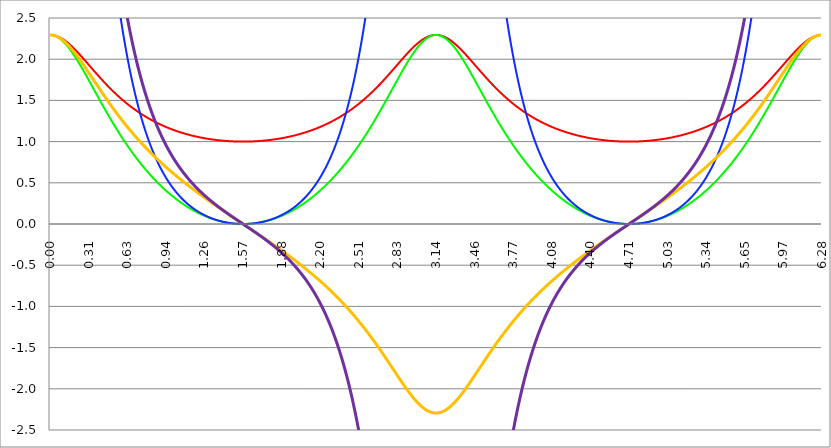
| Category | Series 1 | Series 0 | Series 2 | Series 3 | Series 4 |
|---|---|---|---|---|---|
| 0.0 | 2.294 | 2.294 | 12.075 | 2.294 | 12.075 |
| 0.00314159265358979 | 2.294 | 2.294 | 12.074 | 2.294 | 12.074 |
| 0.00628318530717958 | 2.294 | 2.294 | 12.071 | 2.294 | 12.071 |
| 0.00942477796076938 | 2.294 | 2.294 | 12.067 | 2.294 | 12.067 |
| 0.0125663706143592 | 2.293 | 2.293 | 12.06 | 2.293 | 12.061 |
| 0.015707963267949 | 2.293 | 2.292 | 12.053 | 2.293 | 12.054 |
| 0.0188495559215388 | 2.292 | 2.292 | 12.043 | 2.292 | 12.045 |
| 0.0219911485751285 | 2.292 | 2.291 | 12.031 | 2.291 | 12.034 |
| 0.0251327412287183 | 2.291 | 2.29 | 12.018 | 2.29 | 12.022 |
| 0.0282743338823081 | 2.29 | 2.288 | 12.003 | 2.289 | 12.008 |
| 0.0314159265358979 | 2.289 | 2.287 | 11.987 | 2.288 | 11.993 |
| 0.0345575191894877 | 2.288 | 2.286 | 11.969 | 2.287 | 11.976 |
| 0.0376991118430775 | 2.287 | 2.284 | 11.949 | 2.286 | 11.957 |
| 0.0408407044966673 | 2.286 | 2.282 | 11.927 | 2.284 | 11.937 |
| 0.0439822971502571 | 2.285 | 2.28 | 11.904 | 2.283 | 11.915 |
| 0.0471238898038469 | 2.283 | 2.278 | 11.879 | 2.281 | 11.892 |
| 0.0502654824574367 | 2.282 | 2.276 | 11.852 | 2.279 | 11.867 |
| 0.0534070751110265 | 2.28 | 2.274 | 11.824 | 2.277 | 11.841 |
| 0.0565486677646163 | 2.279 | 2.271 | 11.794 | 2.275 | 11.813 |
| 0.059690260418206 | 2.277 | 2.269 | 11.763 | 2.273 | 11.784 |
| 0.0628318530717958 | 2.275 | 2.266 | 11.73 | 2.271 | 11.753 |
| 0.0659734457253856 | 2.273 | 2.263 | 11.695 | 2.268 | 11.721 |
| 0.0691150383789754 | 2.271 | 2.26 | 11.66 | 2.266 | 11.687 |
| 0.0722566310325652 | 2.269 | 2.257 | 11.622 | 2.263 | 11.652 |
| 0.075398223686155 | 2.267 | 2.254 | 11.583 | 2.26 | 11.616 |
| 0.0785398163397448 | 2.265 | 2.251 | 11.543 | 2.258 | 11.579 |
| 0.0816814089933346 | 2.262 | 2.247 | 11.501 | 2.255 | 11.54 |
| 0.0848230016469244 | 2.26 | 2.244 | 11.458 | 2.252 | 11.499 |
| 0.0879645943005142 | 2.257 | 2.24 | 11.413 | 2.249 | 11.458 |
| 0.091106186954104 | 2.255 | 2.236 | 11.368 | 2.245 | 11.415 |
| 0.0942477796076937 | 2.252 | 2.232 | 11.32 | 2.242 | 11.371 |
| 0.0973893722612835 | 2.249 | 2.228 | 11.272 | 2.239 | 11.326 |
| 0.100530964914873 | 2.246 | 2.224 | 11.222 | 2.235 | 11.279 |
| 0.103672557568463 | 2.244 | 2.219 | 11.171 | 2.231 | 11.232 |
| 0.106814150222053 | 2.241 | 2.215 | 11.119 | 2.228 | 11.183 |
| 0.109955742875643 | 2.237 | 2.211 | 11.066 | 2.224 | 11.133 |
| 0.113097335529233 | 2.234 | 2.206 | 11.012 | 2.22 | 11.083 |
| 0.116238928182822 | 2.231 | 2.201 | 10.956 | 2.216 | 11.031 |
| 0.119380520836412 | 2.228 | 2.196 | 10.9 | 2.212 | 10.978 |
| 0.122522113490002 | 2.224 | 2.191 | 10.842 | 2.208 | 10.924 |
| 0.125663706143592 | 2.221 | 2.186 | 10.784 | 2.203 | 10.869 |
| 0.128805298797181 | 2.217 | 2.181 | 10.724 | 2.199 | 10.814 |
| 0.131946891450771 | 2.214 | 2.176 | 10.664 | 2.195 | 10.757 |
| 0.135088484104361 | 2.21 | 2.17 | 10.602 | 2.19 | 10.7 |
| 0.138230076757951 | 2.207 | 2.165 | 10.54 | 2.186 | 10.642 |
| 0.141371669411541 | 2.203 | 2.159 | 10.477 | 2.181 | 10.583 |
| 0.14451326206513 | 2.199 | 2.153 | 10.413 | 2.176 | 10.523 |
| 0.14765485471872 | 2.195 | 2.148 | 10.348 | 2.171 | 10.462 |
| 0.15079644737231 | 2.191 | 2.142 | 10.283 | 2.166 | 10.401 |
| 0.1539380400259 | 2.187 | 2.136 | 10.217 | 2.161 | 10.339 |
| 0.15707963267949 | 2.183 | 2.13 | 10.15 | 2.156 | 10.276 |
| 0.160221225333079 | 2.179 | 2.124 | 10.082 | 2.151 | 10.213 |
| 0.163362817986669 | 2.175 | 2.117 | 10.014 | 2.146 | 10.149 |
| 0.166504410640259 | 2.171 | 2.111 | 9.946 | 2.141 | 10.085 |
| 0.169646003293849 | 2.166 | 2.105 | 9.876 | 2.135 | 10.02 |
| 0.172787595947439 | 2.162 | 2.098 | 9.807 | 2.13 | 9.955 |
| 0.175929188601028 | 2.158 | 2.092 | 9.736 | 2.124 | 9.889 |
| 0.179070781254618 | 2.153 | 2.085 | 9.666 | 2.119 | 9.823 |
| 0.182212373908208 | 2.149 | 2.078 | 9.594 | 2.113 | 9.756 |
| 0.185353966561798 | 2.144 | 2.071 | 9.523 | 2.107 | 9.689 |
| 0.188495559215388 | 2.14 | 2.064 | 9.451 | 2.102 | 9.621 |
| 0.191637151868977 | 2.135 | 2.058 | 9.379 | 2.096 | 9.554 |
| 0.194778744522567 | 2.13 | 2.051 | 9.306 | 2.09 | 9.485 |
| 0.197920337176157 | 2.126 | 2.043 | 9.233 | 2.084 | 9.417 |
| 0.201061929829747 | 2.121 | 2.036 | 9.16 | 2.078 | 9.348 |
| 0.204203522483336 | 2.116 | 2.029 | 9.087 | 2.072 | 9.279 |
| 0.207345115136926 | 2.111 | 2.022 | 9.013 | 2.066 | 9.21 |
| 0.210486707790516 | 2.107 | 2.015 | 8.939 | 2.06 | 9.141 |
| 0.213628300444106 | 2.102 | 2.007 | 8.865 | 2.054 | 9.071 |
| 0.216769893097696 | 2.097 | 2 | 8.791 | 2.048 | 9.002 |
| 0.219911485751285 | 2.092 | 1.992 | 8.717 | 2.041 | 8.932 |
| 0.223053078404875 | 2.087 | 1.985 | 8.643 | 2.035 | 8.862 |
| 0.226194671058465 | 2.082 | 1.977 | 8.568 | 2.029 | 8.792 |
| 0.229336263712055 | 2.077 | 1.969 | 8.494 | 2.022 | 8.722 |
| 0.232477856365645 | 2.072 | 1.962 | 8.42 | 2.016 | 8.652 |
| 0.235619449019234 | 2.067 | 1.954 | 8.345 | 2.01 | 8.582 |
| 0.238761041672824 | 2.062 | 1.946 | 8.271 | 2.003 | 8.512 |
| 0.241902634326414 | 2.056 | 1.938 | 8.197 | 1.996 | 8.443 |
| 0.245044226980004 | 2.051 | 1.93 | 8.122 | 1.99 | 8.373 |
| 0.248185819633594 | 2.046 | 1.923 | 8.048 | 1.983 | 8.303 |
| 0.251327412287183 | 2.041 | 1.915 | 7.974 | 1.977 | 8.233 |
| 0.254469004940773 | 2.036 | 1.907 | 7.901 | 1.97 | 8.163 |
| 0.257610597594363 | 2.03 | 1.899 | 7.827 | 1.963 | 8.094 |
| 0.260752190247953 | 2.025 | 1.891 | 7.753 | 1.957 | 8.024 |
| 0.263893782901543 | 2.02 | 1.882 | 7.68 | 1.95 | 7.955 |
| 0.267035375555132 | 2.015 | 1.874 | 7.607 | 1.943 | 7.886 |
| 0.270176968208722 | 2.009 | 1.866 | 7.534 | 1.936 | 7.817 |
| 0.273318560862312 | 2.004 | 1.858 | 7.461 | 1.93 | 7.749 |
| 0.276460153515902 | 1.999 | 1.85 | 7.389 | 1.923 | 7.68 |
| 0.279601746169492 | 1.993 | 1.841 | 7.316 | 1.916 | 7.612 |
| 0.282743338823082 | 1.988 | 1.833 | 7.244 | 1.909 | 7.544 |
| 0.285884931476671 | 1.983 | 1.825 | 7.173 | 1.902 | 7.476 |
| 0.289026524130261 | 1.977 | 1.817 | 7.102 | 1.895 | 7.409 |
| 0.292168116783851 | 1.972 | 1.808 | 7.03 | 1.888 | 7.342 |
| 0.295309709437441 | 1.966 | 1.8 | 6.96 | 1.881 | 7.275 |
| 0.298451302091031 | 1.961 | 1.791 | 6.889 | 1.874 | 7.208 |
| 0.30159289474462 | 1.956 | 1.783 | 6.819 | 1.867 | 7.142 |
| 0.30473448739821 | 1.95 | 1.775 | 6.75 | 1.86 | 7.076 |
| 0.3078760800518 | 1.945 | 1.766 | 6.681 | 1.853 | 7.01 |
| 0.31101767270539 | 1.939 | 1.758 | 6.612 | 1.846 | 6.945 |
| 0.31415926535898 | 1.934 | 1.749 | 6.543 | 1.839 | 6.88 |
| 0.31730085801257 | 1.929 | 1.741 | 6.475 | 1.832 | 6.815 |
| 0.320442450666159 | 1.923 | 1.732 | 6.408 | 1.825 | 6.751 |
| 0.323584043319749 | 1.918 | 1.724 | 6.34 | 1.818 | 6.687 |
| 0.326725635973339 | 1.912 | 1.715 | 6.274 | 1.811 | 6.624 |
| 0.329867228626929 | 1.907 | 1.707 | 6.207 | 1.804 | 6.561 |
| 0.333008821280519 | 1.902 | 1.698 | 6.141 | 1.797 | 6.498 |
| 0.336150413934108 | 1.896 | 1.69 | 6.076 | 1.79 | 6.436 |
| 0.339292006587698 | 1.891 | 1.681 | 6.011 | 1.783 | 6.374 |
| 0.342433599241288 | 1.885 | 1.673 | 5.946 | 1.776 | 6.313 |
| 0.345575191894878 | 1.88 | 1.664 | 5.882 | 1.769 | 6.252 |
| 0.348716784548468 | 1.875 | 1.656 | 5.818 | 1.762 | 6.191 |
| 0.351858377202058 | 1.869 | 1.647 | 5.755 | 1.755 | 6.131 |
| 0.354999969855647 | 1.864 | 1.639 | 5.692 | 1.748 | 6.071 |
| 0.358141562509237 | 1.858 | 1.63 | 5.63 | 1.741 | 6.012 |
| 0.361283155162827 | 1.853 | 1.622 | 5.568 | 1.733 | 5.953 |
| 0.364424747816417 | 1.848 | 1.613 | 5.507 | 1.726 | 5.894 |
| 0.367566340470007 | 1.842 | 1.605 | 5.446 | 1.719 | 5.836 |
| 0.370707933123597 | 1.837 | 1.596 | 5.386 | 1.712 | 5.779 |
| 0.373849525777186 | 1.832 | 1.587 | 5.326 | 1.705 | 5.722 |
| 0.376991118430776 | 1.826 | 1.579 | 5.267 | 1.698 | 5.665 |
| 0.380132711084366 | 1.821 | 1.57 | 5.208 | 1.691 | 5.609 |
| 0.383274303737956 | 1.816 | 1.562 | 5.15 | 1.684 | 5.553 |
| 0.386415896391546 | 1.811 | 1.553 | 5.092 | 1.677 | 5.498 |
| 0.389557489045135 | 1.805 | 1.545 | 5.035 | 1.67 | 5.443 |
| 0.392699081698725 | 1.8 | 1.536 | 4.978 | 1.663 | 5.389 |
| 0.395840674352315 | 1.795 | 1.528 | 4.922 | 1.656 | 5.335 |
| 0.398982267005905 | 1.79 | 1.52 | 4.866 | 1.649 | 5.281 |
| 0.402123859659495 | 1.784 | 1.511 | 4.811 | 1.642 | 5.228 |
| 0.405265452313085 | 1.779 | 1.503 | 4.756 | 1.635 | 5.176 |
| 0.408407044966674 | 1.774 | 1.494 | 4.702 | 1.628 | 5.124 |
| 0.411548637620264 | 1.769 | 1.486 | 4.649 | 1.621 | 5.072 |
| 0.414690230273854 | 1.764 | 1.477 | 4.595 | 1.614 | 5.021 |
| 0.417831822927444 | 1.759 | 1.469 | 4.543 | 1.607 | 4.97 |
| 0.420973415581034 | 1.753 | 1.461 | 4.49 | 1.6 | 4.92 |
| 0.424115008234623 | 1.748 | 1.452 | 4.439 | 1.593 | 4.87 |
| 0.427256600888213 | 1.743 | 1.444 | 4.388 | 1.586 | 4.821 |
| 0.430398193541803 | 1.738 | 1.436 | 4.337 | 1.58 | 4.772 |
| 0.433539786195393 | 1.733 | 1.427 | 4.287 | 1.573 | 4.724 |
| 0.436681378848983 | 1.728 | 1.419 | 4.237 | 1.566 | 4.676 |
| 0.439822971502573 | 1.723 | 1.411 | 4.188 | 1.559 | 4.628 |
| 0.442964564156162 | 1.718 | 1.402 | 4.139 | 1.552 | 4.581 |
| 0.446106156809752 | 1.713 | 1.394 | 4.091 | 1.545 | 4.535 |
| 0.449247749463342 | 1.708 | 1.386 | 4.043 | 1.539 | 4.489 |
| 0.452389342116932 | 1.703 | 1.378 | 3.996 | 1.532 | 4.443 |
| 0.455530934770522 | 1.698 | 1.369 | 3.949 | 1.525 | 4.398 |
| 0.458672527424111 | 1.693 | 1.361 | 3.903 | 1.518 | 4.353 |
| 0.461814120077701 | 1.688 | 1.353 | 3.857 | 1.511 | 4.309 |
| 0.464955712731291 | 1.683 | 1.345 | 3.812 | 1.505 | 4.265 |
| 0.468097305384881 | 1.679 | 1.337 | 3.767 | 1.498 | 4.221 |
| 0.471238898038471 | 1.674 | 1.329 | 3.723 | 1.491 | 4.178 |
| 0.474380490692061 | 1.669 | 1.321 | 3.679 | 1.485 | 4.135 |
| 0.47752208334565 | 1.664 | 1.313 | 3.635 | 1.478 | 4.093 |
| 0.48066367599924 | 1.659 | 1.305 | 3.592 | 1.471 | 4.051 |
| 0.48380526865283 | 1.655 | 1.297 | 3.55 | 1.465 | 4.01 |
| 0.48694686130642 | 1.65 | 1.289 | 3.508 | 1.458 | 3.969 |
| 0.49008845396001 | 1.645 | 1.281 | 3.466 | 1.452 | 3.929 |
| 0.493230046613599 | 1.64 | 1.273 | 3.425 | 1.445 | 3.889 |
| 0.496371639267189 | 1.636 | 1.265 | 3.384 | 1.438 | 3.849 |
| 0.499513231920779 | 1.631 | 1.257 | 3.344 | 1.432 | 3.81 |
| 0.502654824574369 | 1.627 | 1.249 | 3.304 | 1.425 | 3.771 |
| 0.505796417227959 | 1.622 | 1.241 | 3.265 | 1.419 | 3.732 |
| 0.508938009881549 | 1.617 | 1.233 | 3.226 | 1.412 | 3.694 |
| 0.512079602535138 | 1.613 | 1.226 | 3.188 | 1.406 | 3.657 |
| 0.515221195188728 | 1.608 | 1.218 | 3.149 | 1.399 | 3.619 |
| 0.518362787842318 | 1.604 | 1.21 | 3.112 | 1.393 | 3.582 |
| 0.521504380495908 | 1.599 | 1.202 | 3.075 | 1.387 | 3.546 |
| 0.524645973149498 | 1.595 | 1.195 | 3.038 | 1.38 | 3.51 |
| 0.527787565803087 | 1.59 | 1.187 | 3.001 | 1.374 | 3.474 |
| 0.530929158456677 | 1.586 | 1.179 | 2.965 | 1.367 | 3.439 |
| 0.534070751110267 | 1.581 | 1.172 | 2.93 | 1.361 | 3.404 |
| 0.537212343763857 | 1.577 | 1.164 | 2.895 | 1.355 | 3.369 |
| 0.540353936417447 | 1.573 | 1.156 | 2.86 | 1.349 | 3.335 |
| 0.543495529071037 | 1.568 | 1.149 | 2.825 | 1.342 | 3.301 |
| 0.546637121724626 | 1.564 | 1.141 | 2.791 | 1.336 | 3.268 |
| 0.549778714378216 | 1.56 | 1.134 | 2.758 | 1.33 | 3.234 |
| 0.552920307031806 | 1.555 | 1.126 | 2.725 | 1.324 | 3.202 |
| 0.556061899685396 | 1.551 | 1.119 | 2.692 | 1.317 | 3.169 |
| 0.559203492338986 | 1.547 | 1.111 | 2.659 | 1.311 | 3.137 |
| 0.562345084992576 | 1.543 | 1.104 | 2.627 | 1.305 | 3.105 |
| 0.565486677646165 | 1.538 | 1.097 | 2.595 | 1.299 | 3.074 |
| 0.568628270299755 | 1.534 | 1.089 | 2.564 | 1.293 | 3.043 |
| 0.571769862953345 | 1.53 | 1.082 | 2.533 | 1.287 | 3.012 |
| 0.574911455606935 | 1.526 | 1.075 | 2.502 | 1.281 | 2.982 |
| 0.578053048260525 | 1.522 | 1.067 | 2.472 | 1.275 | 2.951 |
| 0.581194640914114 | 1.518 | 1.06 | 2.442 | 1.268 | 2.922 |
| 0.584336233567704 | 1.514 | 1.053 | 2.412 | 1.262 | 2.892 |
| 0.587477826221294 | 1.51 | 1.046 | 2.383 | 1.256 | 2.863 |
| 0.590619418874884 | 1.506 | 1.039 | 2.354 | 1.25 | 2.834 |
| 0.593761011528474 | 1.502 | 1.032 | 2.326 | 1.245 | 2.806 |
| 0.596902604182064 | 1.498 | 1.024 | 2.297 | 1.239 | 2.778 |
| 0.600044196835653 | 1.494 | 1.017 | 2.269 | 1.233 | 2.75 |
| 0.603185789489243 | 1.49 | 1.01 | 2.242 | 1.227 | 2.722 |
| 0.606327382142833 | 1.486 | 1.003 | 2.215 | 1.221 | 2.695 |
| 0.609468974796423 | 1.482 | 0.996 | 2.188 | 1.215 | 2.668 |
| 0.612610567450013 | 1.478 | 0.989 | 2.161 | 1.209 | 2.641 |
| 0.615752160103602 | 1.474 | 0.982 | 2.135 | 1.203 | 2.615 |
| 0.618893752757192 | 1.47 | 0.975 | 2.109 | 1.198 | 2.589 |
| 0.622035345410782 | 1.466 | 0.969 | 2.083 | 1.192 | 2.563 |
| 0.625176938064372 | 1.463 | 0.962 | 2.057 | 1.186 | 2.537 |
| 0.628318530717962 | 1.459 | 0.955 | 2.032 | 1.18 | 2.512 |
| 0.631460123371551 | 1.455 | 0.948 | 2.007 | 1.175 | 2.487 |
| 0.634601716025141 | 1.451 | 0.941 | 1.983 | 1.169 | 2.462 |
| 0.637743308678731 | 1.448 | 0.935 | 1.959 | 1.163 | 2.438 |
| 0.640884901332321 | 1.444 | 0.928 | 1.935 | 1.157 | 2.414 |
| 0.644026493985911 | 1.44 | 0.921 | 1.911 | 1.152 | 2.39 |
| 0.647168086639501 | 1.437 | 0.914 | 1.888 | 1.146 | 2.366 |
| 0.65030967929309 | 1.433 | 0.908 | 1.864 | 1.141 | 2.343 |
| 0.65345127194668 | 1.43 | 0.901 | 1.842 | 1.135 | 2.319 |
| 0.65659286460027 | 1.426 | 0.895 | 1.819 | 1.129 | 2.296 |
| 0.65973445725386 | 1.422 | 0.888 | 1.797 | 1.124 | 2.274 |
| 0.66287604990745 | 1.419 | 0.882 | 1.775 | 1.118 | 2.251 |
| 0.666017642561039 | 1.415 | 0.875 | 1.753 | 1.113 | 2.229 |
| 0.669159235214629 | 1.412 | 0.869 | 1.731 | 1.107 | 2.207 |
| 0.672300827868219 | 1.408 | 0.862 | 1.71 | 1.102 | 2.186 |
| 0.675442420521809 | 1.405 | 0.856 | 1.689 | 1.096 | 2.164 |
| 0.678584013175399 | 1.401 | 0.849 | 1.668 | 1.091 | 2.143 |
| 0.681725605828989 | 1.398 | 0.843 | 1.648 | 1.086 | 2.122 |
| 0.684867198482578 | 1.395 | 0.837 | 1.627 | 1.08 | 2.101 |
| 0.688008791136168 | 1.391 | 0.83 | 1.607 | 1.075 | 2.08 |
| 0.691150383789758 | 1.388 | 0.824 | 1.587 | 1.069 | 2.06 |
| 0.694291976443348 | 1.385 | 0.818 | 1.568 | 1.064 | 2.04 |
| 0.697433569096938 | 1.381 | 0.812 | 1.548 | 1.059 | 2.02 |
| 0.700575161750528 | 1.378 | 0.805 | 1.529 | 1.053 | 2 |
| 0.703716754404117 | 1.375 | 0.799 | 1.51 | 1.048 | 1.981 |
| 0.706858347057707 | 1.371 | 0.793 | 1.492 | 1.043 | 1.962 |
| 0.709999939711297 | 1.368 | 0.787 | 1.473 | 1.038 | 1.943 |
| 0.713141532364887 | 1.365 | 0.781 | 1.455 | 1.032 | 1.924 |
| 0.716283125018477 | 1.362 | 0.775 | 1.437 | 1.027 | 1.905 |
| 0.719424717672066 | 1.359 | 0.769 | 1.419 | 1.022 | 1.887 |
| 0.722566310325656 | 1.356 | 0.763 | 1.401 | 1.017 | 1.868 |
| 0.725707902979246 | 1.352 | 0.757 | 1.384 | 1.012 | 1.85 |
| 0.728849495632836 | 1.349 | 0.751 | 1.367 | 1.006 | 1.832 |
| 0.731991088286426 | 1.346 | 0.745 | 1.35 | 1.001 | 1.815 |
| 0.735132680940016 | 1.343 | 0.739 | 1.333 | 0.996 | 1.797 |
| 0.738274273593605 | 1.34 | 0.733 | 1.316 | 0.991 | 1.78 |
| 0.741415866247195 | 1.337 | 0.727 | 1.3 | 0.986 | 1.763 |
| 0.744557458900785 | 1.334 | 0.721 | 1.284 | 0.981 | 1.746 |
| 0.747699051554375 | 1.331 | 0.716 | 1.268 | 0.976 | 1.729 |
| 0.750840644207965 | 1.328 | 0.71 | 1.252 | 0.971 | 1.712 |
| 0.753982236861554 | 1.325 | 0.704 | 1.236 | 0.966 | 1.696 |
| 0.757123829515144 | 1.322 | 0.698 | 1.221 | 0.961 | 1.68 |
| 0.760265422168734 | 1.319 | 0.693 | 1.205 | 0.956 | 1.664 |
| 0.763407014822324 | 1.316 | 0.687 | 1.19 | 0.951 | 1.648 |
| 0.766548607475914 | 1.313 | 0.681 | 1.175 | 0.946 | 1.632 |
| 0.769690200129504 | 1.31 | 0.676 | 1.161 | 0.941 | 1.616 |
| 0.772831792783093 | 1.308 | 0.67 | 1.146 | 0.936 | 1.601 |
| 0.775973385436683 | 1.305 | 0.665 | 1.132 | 0.931 | 1.586 |
| 0.779114978090273 | 1.302 | 0.659 | 1.117 | 0.926 | 1.57 |
| 0.782256570743863 | 1.299 | 0.654 | 1.103 | 0.922 | 1.555 |
| 0.785398163397453 | 1.296 | 0.648 | 1.089 | 0.917 | 1.541 |
| 0.788539756051042 | 1.294 | 0.643 | 1.076 | 0.912 | 1.526 |
| 0.791681348704632 | 1.291 | 0.637 | 1.062 | 0.907 | 1.512 |
| 0.794822941358222 | 1.288 | 0.632 | 1.049 | 0.902 | 1.497 |
| 0.797964534011812 | 1.285 | 0.627 | 1.035 | 0.897 | 1.483 |
| 0.801106126665402 | 1.283 | 0.621 | 1.022 | 0.893 | 1.469 |
| 0.804247719318992 | 1.28 | 0.616 | 1.009 | 0.888 | 1.455 |
| 0.807389311972581 | 1.277 | 0.611 | 0.996 | 0.883 | 1.441 |
| 0.810530904626171 | 1.275 | 0.605 | 0.984 | 0.878 | 1.428 |
| 0.813672497279761 | 1.272 | 0.6 | 0.971 | 0.874 | 1.414 |
| 0.816814089933351 | 1.27 | 0.595 | 0.959 | 0.869 | 1.401 |
| 0.819955682586941 | 1.267 | 0.59 | 0.947 | 0.864 | 1.388 |
| 0.823097275240531 | 1.264 | 0.585 | 0.935 | 0.86 | 1.374 |
| 0.82623886789412 | 1.262 | 0.579 | 0.923 | 0.855 | 1.362 |
| 0.82938046054771 | 1.259 | 0.574 | 0.911 | 0.85 | 1.349 |
| 0.8325220532013 | 1.257 | 0.569 | 0.899 | 0.846 | 1.336 |
| 0.83566364585489 | 1.254 | 0.564 | 0.888 | 0.841 | 1.323 |
| 0.83880523850848 | 1.252 | 0.559 | 0.876 | 0.837 | 1.311 |
| 0.841946831162069 | 1.249 | 0.554 | 0.865 | 0.832 | 1.299 |
| 0.845088423815659 | 1.247 | 0.549 | 0.854 | 0.827 | 1.286 |
| 0.848230016469249 | 1.244 | 0.544 | 0.843 | 0.823 | 1.274 |
| 0.851371609122839 | 1.242 | 0.539 | 0.832 | 0.818 | 1.262 |
| 0.854513201776429 | 1.24 | 0.534 | 0.821 | 0.814 | 1.251 |
| 0.857654794430019 | 1.237 | 0.53 | 0.81 | 0.809 | 1.239 |
| 0.860796387083608 | 1.235 | 0.525 | 0.8 | 0.805 | 1.227 |
| 0.863937979737198 | 1.232 | 0.52 | 0.79 | 0.8 | 1.216 |
| 0.867079572390788 | 1.23 | 0.515 | 0.779 | 0.796 | 1.204 |
| 0.870221165044378 | 1.228 | 0.51 | 0.769 | 0.791 | 1.193 |
| 0.873362757697968 | 1.225 | 0.505 | 0.759 | 0.787 | 1.182 |
| 0.876504350351557 | 1.223 | 0.501 | 0.749 | 0.783 | 1.171 |
| 0.879645943005147 | 1.221 | 0.496 | 0.739 | 0.778 | 1.16 |
| 0.882787535658737 | 1.219 | 0.491 | 0.73 | 0.774 | 1.149 |
| 0.885929128312327 | 1.216 | 0.487 | 0.72 | 0.769 | 1.138 |
| 0.889070720965917 | 1.214 | 0.482 | 0.711 | 0.765 | 1.128 |
| 0.892212313619507 | 1.212 | 0.477 | 0.701 | 0.761 | 1.117 |
| 0.895353906273096 | 1.21 | 0.473 | 0.692 | 0.756 | 1.107 |
| 0.898495498926686 | 1.208 | 0.468 | 0.683 | 0.752 | 1.097 |
| 0.901637091580276 | 1.205 | 0.464 | 0.674 | 0.748 | 1.086 |
| 0.904778684233866 | 1.203 | 0.459 | 0.665 | 0.743 | 1.076 |
| 0.907920276887456 | 1.201 | 0.455 | 0.656 | 0.739 | 1.066 |
| 0.911061869541045 | 1.199 | 0.45 | 0.647 | 0.735 | 1.056 |
| 0.914203462194635 | 1.197 | 0.446 | 0.639 | 0.731 | 1.046 |
| 0.917345054848225 | 1.195 | 0.442 | 0.63 | 0.726 | 1.037 |
| 0.920486647501815 | 1.193 | 0.437 | 0.622 | 0.722 | 1.027 |
| 0.923628240155405 | 1.191 | 0.433 | 0.613 | 0.718 | 1.017 |
| 0.926769832808995 | 1.188 | 0.428 | 0.605 | 0.714 | 1.008 |
| 0.929911425462584 | 1.186 | 0.424 | 0.597 | 0.709 | 0.998 |
| 0.933053018116174 | 1.184 | 0.42 | 0.589 | 0.705 | 0.989 |
| 0.936194610769764 | 1.182 | 0.416 | 0.581 | 0.701 | 0.98 |
| 0.939336203423354 | 1.18 | 0.411 | 0.573 | 0.697 | 0.971 |
| 0.942477796076944 | 1.178 | 0.407 | 0.565 | 0.693 | 0.962 |
| 0.945619388730533 | 1.176 | 0.403 | 0.558 | 0.688 | 0.953 |
| 0.948760981384123 | 1.174 | 0.399 | 0.55 | 0.684 | 0.944 |
| 0.951902574037713 | 1.173 | 0.395 | 0.543 | 0.68 | 0.935 |
| 0.955044166691303 | 1.171 | 0.39 | 0.535 | 0.676 | 0.926 |
| 0.958185759344893 | 1.169 | 0.386 | 0.528 | 0.672 | 0.918 |
| 0.961327351998483 | 1.167 | 0.382 | 0.52 | 0.668 | 0.909 |
| 0.964468944652072 | 1.165 | 0.378 | 0.513 | 0.664 | 0.901 |
| 0.967610537305662 | 1.163 | 0.374 | 0.506 | 0.66 | 0.892 |
| 0.970752129959252 | 1.161 | 0.37 | 0.499 | 0.656 | 0.884 |
| 0.973893722612842 | 1.159 | 0.366 | 0.492 | 0.652 | 0.876 |
| 0.977035315266432 | 1.157 | 0.362 | 0.485 | 0.648 | 0.868 |
| 0.980176907920022 | 1.156 | 0.358 | 0.479 | 0.644 | 0.859 |
| 0.983318500573611 | 1.154 | 0.354 | 0.472 | 0.64 | 0.851 |
| 0.986460093227201 | 1.152 | 0.351 | 0.465 | 0.636 | 0.843 |
| 0.989601685880791 | 1.15 | 0.347 | 0.459 | 0.632 | 0.835 |
| 0.992743278534381 | 1.148 | 0.343 | 0.452 | 0.628 | 0.828 |
| 0.995884871187971 | 1.147 | 0.339 | 0.446 | 0.624 | 0.82 |
| 0.99902646384156 | 1.145 | 0.335 | 0.439 | 0.62 | 0.812 |
| 1.00216805649515 | 1.143 | 0.331 | 0.433 | 0.616 | 0.805 |
| 1.00530964914874 | 1.142 | 0.328 | 0.427 | 0.612 | 0.797 |
| 1.00845124180233 | 1.14 | 0.324 | 0.421 | 0.608 | 0.789 |
| 1.01159283445592 | 1.138 | 0.32 | 0.415 | 0.604 | 0.782 |
| 1.01473442710951 | 1.136 | 0.317 | 0.409 | 0.6 | 0.775 |
| 1.017876019763099 | 1.135 | 0.313 | 0.403 | 0.596 | 0.767 |
| 1.021017612416689 | 1.133 | 0.309 | 0.397 | 0.592 | 0.76 |
| 1.02415920507028 | 1.131 | 0.306 | 0.391 | 0.588 | 0.753 |
| 1.027300797723869 | 1.13 | 0.302 | 0.386 | 0.584 | 0.746 |
| 1.030442390377459 | 1.128 | 0.299 | 0.38 | 0.58 | 0.739 |
| 1.033583983031048 | 1.127 | 0.295 | 0.374 | 0.577 | 0.732 |
| 1.036725575684638 | 1.125 | 0.292 | 0.369 | 0.573 | 0.725 |
| 1.039867168338228 | 1.123 | 0.288 | 0.364 | 0.569 | 0.718 |
| 1.043008760991818 | 1.122 | 0.285 | 0.358 | 0.565 | 0.711 |
| 1.046150353645408 | 1.12 | 0.281 | 0.353 | 0.561 | 0.704 |
| 1.049291946298998 | 1.119 | 0.278 | 0.348 | 0.557 | 0.698 |
| 1.052433538952587 | 1.117 | 0.274 | 0.342 | 0.554 | 0.691 |
| 1.055575131606177 | 1.116 | 0.271 | 0.337 | 0.55 | 0.684 |
| 1.058716724259767 | 1.114 | 0.268 | 0.332 | 0.546 | 0.678 |
| 1.061858316913357 | 1.113 | 0.264 | 0.327 | 0.542 | 0.671 |
| 1.064999909566947 | 1.111 | 0.261 | 0.322 | 0.538 | 0.665 |
| 1.068141502220536 | 1.11 | 0.258 | 0.317 | 0.535 | 0.658 |
| 1.071283094874126 | 1.108 | 0.254 | 0.312 | 0.531 | 0.652 |
| 1.074424687527716 | 1.107 | 0.251 | 0.308 | 0.527 | 0.646 |
| 1.077566280181306 | 1.105 | 0.248 | 0.303 | 0.523 | 0.639 |
| 1.080707872834896 | 1.104 | 0.245 | 0.298 | 0.52 | 0.633 |
| 1.083849465488486 | 1.103 | 0.241 | 0.293 | 0.516 | 0.627 |
| 1.086991058142075 | 1.101 | 0.238 | 0.289 | 0.512 | 0.621 |
| 1.090132650795665 | 1.1 | 0.235 | 0.284 | 0.508 | 0.615 |
| 1.093274243449255 | 1.098 | 0.232 | 0.28 | 0.505 | 0.609 |
| 1.096415836102845 | 1.097 | 0.229 | 0.275 | 0.501 | 0.603 |
| 1.099557428756435 | 1.096 | 0.226 | 0.271 | 0.497 | 0.597 |
| 1.102699021410025 | 1.094 | 0.223 | 0.267 | 0.494 | 0.591 |
| 1.105840614063614 | 1.093 | 0.22 | 0.262 | 0.49 | 0.585 |
| 1.108982206717204 | 1.092 | 0.217 | 0.258 | 0.486 | 0.58 |
| 1.112123799370794 | 1.09 | 0.214 | 0.254 | 0.483 | 0.574 |
| 1.115265392024384 | 1.089 | 0.211 | 0.25 | 0.479 | 0.568 |
| 1.118406984677974 | 1.088 | 0.208 | 0.246 | 0.475 | 0.563 |
| 1.121548577331563 | 1.086 | 0.205 | 0.242 | 0.472 | 0.557 |
| 1.124690169985153 | 1.085 | 0.202 | 0.238 | 0.468 | 0.551 |
| 1.127831762638743 | 1.084 | 0.199 | 0.234 | 0.465 | 0.546 |
| 1.130973355292333 | 1.083 | 0.196 | 0.23 | 0.461 | 0.54 |
| 1.134114947945923 | 1.081 | 0.193 | 0.226 | 0.457 | 0.535 |
| 1.137256540599513 | 1.08 | 0.191 | 0.222 | 0.454 | 0.529 |
| 1.140398133253102 | 1.079 | 0.188 | 0.219 | 0.45 | 0.524 |
| 1.143539725906692 | 1.078 | 0.185 | 0.215 | 0.447 | 0.519 |
| 1.146681318560282 | 1.077 | 0.182 | 0.211 | 0.443 | 0.513 |
| 1.149822911213872 | 1.075 | 0.18 | 0.208 | 0.439 | 0.508 |
| 1.152964503867462 | 1.074 | 0.177 | 0.204 | 0.436 | 0.503 |
| 1.156106096521051 | 1.073 | 0.174 | 0.201 | 0.432 | 0.498 |
| 1.159247689174641 | 1.072 | 0.172 | 0.197 | 0.429 | 0.493 |
| 1.162389281828231 | 1.071 | 0.169 | 0.194 | 0.425 | 0.488 |
| 1.165530874481821 | 1.07 | 0.166 | 0.19 | 0.422 | 0.482 |
| 1.168672467135411 | 1.068 | 0.164 | 0.187 | 0.418 | 0.477 |
| 1.171814059789001 | 1.067 | 0.161 | 0.184 | 0.415 | 0.472 |
| 1.17495565244259 | 1.066 | 0.159 | 0.18 | 0.411 | 0.467 |
| 1.17809724509618 | 1.065 | 0.156 | 0.177 | 0.408 | 0.462 |
| 1.18123883774977 | 1.064 | 0.153 | 0.174 | 0.404 | 0.458 |
| 1.18438043040336 | 1.063 | 0.151 | 0.171 | 0.401 | 0.453 |
| 1.18752202305695 | 1.062 | 0.149 | 0.167 | 0.397 | 0.448 |
| 1.190663615710539 | 1.061 | 0.146 | 0.164 | 0.394 | 0.443 |
| 1.193805208364129 | 1.06 | 0.144 | 0.161 | 0.39 | 0.438 |
| 1.19694680101772 | 1.059 | 0.141 | 0.158 | 0.387 | 0.434 |
| 1.200088393671309 | 1.058 | 0.139 | 0.155 | 0.383 | 0.429 |
| 1.203229986324899 | 1.057 | 0.136 | 0.152 | 0.38 | 0.424 |
| 1.206371578978489 | 1.056 | 0.134 | 0.149 | 0.376 | 0.419 |
| 1.209513171632078 | 1.055 | 0.132 | 0.147 | 0.373 | 0.415 |
| 1.212654764285668 | 1.054 | 0.129 | 0.144 | 0.369 | 0.41 |
| 1.215796356939258 | 1.053 | 0.127 | 0.141 | 0.366 | 0.406 |
| 1.218937949592848 | 1.052 | 0.125 | 0.138 | 0.363 | 0.401 |
| 1.222079542246438 | 1.051 | 0.123 | 0.136 | 0.359 | 0.397 |
| 1.225221134900027 | 1.05 | 0.12 | 0.133 | 0.356 | 0.392 |
| 1.228362727553617 | 1.049 | 0.118 | 0.13 | 0.352 | 0.388 |
| 1.231504320207207 | 1.048 | 0.116 | 0.128 | 0.349 | 0.383 |
| 1.234645912860797 | 1.047 | 0.114 | 0.125 | 0.345 | 0.379 |
| 1.237787505514387 | 1.046 | 0.112 | 0.122 | 0.342 | 0.374 |
| 1.240929098167977 | 1.045 | 0.11 | 0.12 | 0.339 | 0.37 |
| 1.244070690821566 | 1.045 | 0.108 | 0.117 | 0.335 | 0.366 |
| 1.247212283475156 | 1.044 | 0.106 | 0.115 | 0.332 | 0.361 |
| 1.250353876128746 | 1.043 | 0.103 | 0.113 | 0.328 | 0.357 |
| 1.253495468782336 | 1.042 | 0.101 | 0.11 | 0.325 | 0.353 |
| 1.256637061435926 | 1.041 | 0.099 | 0.108 | 0.322 | 0.349 |
| 1.259778654089515 | 1.04 | 0.097 | 0.105 | 0.318 | 0.344 |
| 1.262920246743105 | 1.039 | 0.095 | 0.103 | 0.315 | 0.34 |
| 1.266061839396695 | 1.039 | 0.093 | 0.101 | 0.312 | 0.336 |
| 1.269203432050285 | 1.038 | 0.092 | 0.099 | 0.308 | 0.332 |
| 1.272345024703875 | 1.037 | 0.09 | 0.096 | 0.305 | 0.328 |
| 1.275486617357465 | 1.036 | 0.088 | 0.094 | 0.302 | 0.324 |
| 1.278628210011054 | 1.035 | 0.086 | 0.092 | 0.298 | 0.32 |
| 1.281769802664644 | 1.035 | 0.084 | 0.09 | 0.295 | 0.316 |
| 1.284911395318234 | 1.034 | 0.082 | 0.088 | 0.292 | 0.312 |
| 1.288052987971824 | 1.033 | 0.08 | 0.086 | 0.288 | 0.308 |
| 1.291194580625414 | 1.032 | 0.079 | 0.084 | 0.285 | 0.304 |
| 1.294336173279003 | 1.032 | 0.077 | 0.082 | 0.282 | 0.3 |
| 1.297477765932593 | 1.031 | 0.075 | 0.08 | 0.278 | 0.296 |
| 1.300619358586183 | 1.03 | 0.073 | 0.078 | 0.275 | 0.292 |
| 1.303760951239773 | 1.029 | 0.072 | 0.076 | 0.272 | 0.288 |
| 1.306902543893363 | 1.029 | 0.07 | 0.074 | 0.268 | 0.284 |
| 1.310044136546953 | 1.028 | 0.068 | 0.072 | 0.265 | 0.28 |
| 1.313185729200542 | 1.027 | 0.067 | 0.07 | 0.262 | 0.276 |
| 1.316327321854132 | 1.027 | 0.065 | 0.069 | 0.258 | 0.272 |
| 1.319468914507722 | 1.026 | 0.063 | 0.067 | 0.255 | 0.269 |
| 1.322610507161312 | 1.025 | 0.062 | 0.065 | 0.252 | 0.265 |
| 1.325752099814902 | 1.025 | 0.06 | 0.063 | 0.249 | 0.261 |
| 1.328893692468491 | 1.024 | 0.059 | 0.062 | 0.245 | 0.257 |
| 1.332035285122081 | 1.023 | 0.057 | 0.06 | 0.242 | 0.254 |
| 1.335176877775671 | 1.023 | 0.056 | 0.058 | 0.239 | 0.25 |
| 1.338318470429261 | 1.022 | 0.054 | 0.057 | 0.236 | 0.246 |
| 1.341460063082851 | 1.022 | 0.053 | 0.055 | 0.232 | 0.242 |
| 1.344601655736441 | 1.021 | 0.051 | 0.054 | 0.229 | 0.239 |
| 1.34774324839003 | 1.02 | 0.05 | 0.052 | 0.226 | 0.235 |
| 1.35088484104362 | 1.02 | 0.049 | 0.05 | 0.222 | 0.231 |
| 1.35402643369721 | 1.019 | 0.047 | 0.049 | 0.219 | 0.228 |
| 1.3571680263508 | 1.019 | 0.046 | 0.048 | 0.216 | 0.224 |
| 1.36030961900439 | 1.018 | 0.044 | 0.046 | 0.213 | 0.221 |
| 1.363451211657979 | 1.018 | 0.043 | 0.045 | 0.209 | 0.217 |
| 1.36659280431157 | 1.017 | 0.042 | 0.043 | 0.206 | 0.213 |
| 1.369734396965159 | 1.017 | 0.041 | 0.042 | 0.203 | 0.21 |
| 1.372875989618749 | 1.016 | 0.039 | 0.041 | 0.2 | 0.206 |
| 1.376017582272339 | 1.016 | 0.038 | 0.039 | 0.197 | 0.203 |
| 1.379159174925929 | 1.015 | 0.037 | 0.038 | 0.193 | 0.199 |
| 1.382300767579518 | 1.015 | 0.036 | 0.037 | 0.19 | 0.196 |
| 1.385442360233108 | 1.014 | 0.034 | 0.035 | 0.187 | 0.192 |
| 1.388583952886698 | 1.014 | 0.033 | 0.034 | 0.184 | 0.189 |
| 1.391725545540288 | 1.013 | 0.032 | 0.033 | 0.18 | 0.185 |
| 1.394867138193878 | 1.013 | 0.031 | 0.032 | 0.177 | 0.182 |
| 1.398008730847468 | 1.012 | 0.03 | 0.031 | 0.174 | 0.178 |
| 1.401150323501057 | 1.012 | 0.029 | 0.03 | 0.171 | 0.175 |
| 1.404291916154647 | 1.011 | 0.028 | 0.028 | 0.168 | 0.171 |
| 1.407433508808237 | 1.011 | 0.027 | 0.027 | 0.164 | 0.168 |
| 1.410575101461827 | 1.01 | 0.026 | 0.026 | 0.161 | 0.165 |
| 1.413716694115417 | 1.01 | 0.025 | 0.025 | 0.158 | 0.161 |
| 1.416858286769006 | 1.01 | 0.024 | 0.024 | 0.155 | 0.158 |
| 1.419999879422596 | 1.009 | 0.023 | 0.023 | 0.152 | 0.154 |
| 1.423141472076186 | 1.009 | 0.022 | 0.022 | 0.148 | 0.151 |
| 1.426283064729776 | 1.009 | 0.021 | 0.021 | 0.145 | 0.148 |
| 1.429424657383366 | 1.008 | 0.02 | 0.02 | 0.142 | 0.144 |
| 1.432566250036956 | 1.008 | 0.019 | 0.019 | 0.139 | 0.141 |
| 1.435707842690545 | 1.007 | 0.018 | 0.019 | 0.136 | 0.138 |
| 1.438849435344135 | 1.007 | 0.017 | 0.018 | 0.132 | 0.134 |
| 1.441991027997725 | 1.007 | 0.017 | 0.017 | 0.129 | 0.131 |
| 1.445132620651315 | 1.006 | 0.016 | 0.016 | 0.126 | 0.128 |
| 1.448274213304905 | 1.006 | 0.015 | 0.015 | 0.123 | 0.124 |
| 1.451415805958494 | 1.006 | 0.014 | 0.014 | 0.12 | 0.121 |
| 1.454557398612084 | 1.005 | 0.014 | 0.014 | 0.117 | 0.118 |
| 1.457698991265674 | 1.005 | 0.013 | 0.013 | 0.113 | 0.115 |
| 1.460840583919264 | 1.005 | 0.012 | 0.012 | 0.11 | 0.111 |
| 1.463982176572854 | 1.005 | 0.011 | 0.012 | 0.107 | 0.108 |
| 1.467123769226444 | 1.004 | 0.011 | 0.011 | 0.104 | 0.105 |
| 1.470265361880033 | 1.004 | 0.01 | 0.01 | 0.101 | 0.102 |
| 1.473406954533623 | 1.004 | 0.009 | 0.01 | 0.098 | 0.098 |
| 1.476548547187213 | 1.004 | 0.009 | 0.009 | 0.094 | 0.095 |
| 1.479690139840803 | 1.003 | 0.008 | 0.008 | 0.091 | 0.092 |
| 1.482831732494393 | 1.003 | 0.008 | 0.008 | 0.088 | 0.089 |
| 1.485973325147982 | 1.003 | 0.007 | 0.007 | 0.085 | 0.085 |
| 1.489114917801572 | 1.003 | 0.007 | 0.007 | 0.082 | 0.082 |
| 1.492256510455162 | 1.003 | 0.006 | 0.006 | 0.079 | 0.079 |
| 1.495398103108752 | 1.002 | 0.006 | 0.006 | 0.076 | 0.076 |
| 1.498539695762342 | 1.002 | 0.005 | 0.005 | 0.072 | 0.073 |
| 1.501681288415932 | 1.002 | 0.005 | 0.005 | 0.069 | 0.069 |
| 1.504822881069521 | 1.002 | 0.004 | 0.004 | 0.066 | 0.066 |
| 1.507964473723111 | 1.002 | 0.004 | 0.004 | 0.063 | 0.063 |
| 1.511106066376701 | 1.001 | 0.004 | 0.004 | 0.06 | 0.06 |
| 1.514247659030291 | 1.001 | 0.003 | 0.003 | 0.057 | 0.057 |
| 1.517389251683881 | 1.001 | 0.003 | 0.003 | 0.053 | 0.054 |
| 1.520530844337471 | 1.001 | 0.003 | 0.003 | 0.05 | 0.05 |
| 1.52367243699106 | 1.001 | 0.002 | 0.002 | 0.047 | 0.047 |
| 1.52681402964465 | 1.001 | 0.002 | 0.002 | 0.044 | 0.044 |
| 1.52995562229824 | 1.001 | 0.002 | 0.002 | 0.041 | 0.041 |
| 1.53309721495183 | 1.001 | 0.001 | 0.001 | 0.038 | 0.038 |
| 1.53623880760542 | 1 | 0.001 | 0.001 | 0.035 | 0.035 |
| 1.539380400259009 | 1 | 0.001 | 0.001 | 0.031 | 0.031 |
| 1.542521992912599 | 1 | 0.001 | 0.001 | 0.028 | 0.028 |
| 1.545663585566189 | 1 | 0.001 | 0.001 | 0.025 | 0.025 |
| 1.548805178219779 | 1 | 0 | 0 | 0.022 | 0.022 |
| 1.551946770873369 | 1 | 0 | 0 | 0.019 | 0.019 |
| 1.555088363526959 | 1 | 0 | 0 | 0.016 | 0.016 |
| 1.558229956180548 | 1 | 0 | 0 | 0.013 | 0.013 |
| 1.561371548834138 | 1 | 0 | 0 | 0.009 | 0.009 |
| 1.564513141487728 | 1 | 0 | 0 | 0.006 | 0.006 |
| 1.567654734141318 | 1 | 0 | 0 | 0.003 | 0.003 |
| 1.570796326794908 | 1 | 0 | 0 | 0 | 0 |
| 1.573937919448497 | 1 | 0 | 0 | -0.003 | -0.003 |
| 1.577079512102087 | 1 | 0 | 0 | -0.006 | -0.006 |
| 1.580221104755677 | 1 | 0 | 0 | -0.009 | -0.009 |
| 1.583362697409267 | 1 | 0 | 0 | -0.013 | -0.013 |
| 1.586504290062857 | 1 | 0 | 0 | -0.016 | -0.016 |
| 1.589645882716447 | 1 | 0 | 0 | -0.019 | -0.019 |
| 1.592787475370036 | 1 | 0 | 0 | -0.022 | -0.022 |
| 1.595929068023626 | 1 | 0.001 | 0.001 | -0.025 | -0.025 |
| 1.599070660677216 | 1 | 0.001 | 0.001 | -0.028 | -0.028 |
| 1.602212253330806 | 1 | 0.001 | 0.001 | -0.031 | -0.031 |
| 1.605353845984396 | 1 | 0.001 | 0.001 | -0.035 | -0.035 |
| 1.608495438637985 | 1.001 | 0.001 | 0.001 | -0.038 | -0.038 |
| 1.611637031291575 | 1.001 | 0.002 | 0.002 | -0.041 | -0.041 |
| 1.614778623945165 | 1.001 | 0.002 | 0.002 | -0.044 | -0.044 |
| 1.617920216598755 | 1.001 | 0.002 | 0.002 | -0.047 | -0.047 |
| 1.621061809252345 | 1.001 | 0.003 | 0.003 | -0.05 | -0.05 |
| 1.624203401905935 | 1.001 | 0.003 | 0.003 | -0.053 | -0.054 |
| 1.627344994559524 | 1.001 | 0.003 | 0.003 | -0.057 | -0.057 |
| 1.630486587213114 | 1.001 | 0.004 | 0.004 | -0.06 | -0.06 |
| 1.633628179866704 | 1.002 | 0.004 | 0.004 | -0.063 | -0.063 |
| 1.636769772520294 | 1.002 | 0.004 | 0.004 | -0.066 | -0.066 |
| 1.639911365173884 | 1.002 | 0.005 | 0.005 | -0.069 | -0.069 |
| 1.643052957827473 | 1.002 | 0.005 | 0.005 | -0.072 | -0.073 |
| 1.646194550481063 | 1.002 | 0.006 | 0.006 | -0.076 | -0.076 |
| 1.649336143134653 | 1.003 | 0.006 | 0.006 | -0.079 | -0.079 |
| 1.652477735788243 | 1.003 | 0.007 | 0.007 | -0.082 | -0.082 |
| 1.655619328441833 | 1.003 | 0.007 | 0.007 | -0.085 | -0.085 |
| 1.658760921095423 | 1.003 | 0.008 | 0.008 | -0.088 | -0.089 |
| 1.661902513749012 | 1.003 | 0.008 | 0.008 | -0.091 | -0.092 |
| 1.665044106402602 | 1.004 | 0.009 | 0.009 | -0.094 | -0.095 |
| 1.668185699056192 | 1.004 | 0.009 | 0.01 | -0.098 | -0.098 |
| 1.671327291709782 | 1.004 | 0.01 | 0.01 | -0.101 | -0.102 |
| 1.674468884363372 | 1.004 | 0.011 | 0.011 | -0.104 | -0.105 |
| 1.677610477016961 | 1.005 | 0.011 | 0.012 | -0.107 | -0.108 |
| 1.680752069670551 | 1.005 | 0.012 | 0.012 | -0.11 | -0.111 |
| 1.683893662324141 | 1.005 | 0.013 | 0.013 | -0.113 | -0.115 |
| 1.687035254977731 | 1.005 | 0.014 | 0.014 | -0.117 | -0.118 |
| 1.690176847631321 | 1.006 | 0.014 | 0.014 | -0.12 | -0.121 |
| 1.693318440284911 | 1.006 | 0.015 | 0.015 | -0.123 | -0.124 |
| 1.6964600329385 | 1.006 | 0.016 | 0.016 | -0.126 | -0.128 |
| 1.69960162559209 | 1.007 | 0.017 | 0.017 | -0.129 | -0.131 |
| 1.70274321824568 | 1.007 | 0.017 | 0.018 | -0.132 | -0.134 |
| 1.70588481089927 | 1.007 | 0.018 | 0.019 | -0.136 | -0.138 |
| 1.70902640355286 | 1.008 | 0.019 | 0.019 | -0.139 | -0.141 |
| 1.712167996206449 | 1.008 | 0.02 | 0.02 | -0.142 | -0.144 |
| 1.715309588860039 | 1.009 | 0.021 | 0.021 | -0.145 | -0.148 |
| 1.71845118151363 | 1.009 | 0.022 | 0.022 | -0.148 | -0.151 |
| 1.721592774167219 | 1.009 | 0.023 | 0.023 | -0.152 | -0.154 |
| 1.724734366820809 | 1.01 | 0.024 | 0.024 | -0.155 | -0.158 |
| 1.727875959474399 | 1.01 | 0.025 | 0.025 | -0.158 | -0.161 |
| 1.731017552127988 | 1.01 | 0.026 | 0.026 | -0.161 | -0.165 |
| 1.734159144781578 | 1.011 | 0.027 | 0.027 | -0.164 | -0.168 |
| 1.737300737435168 | 1.011 | 0.028 | 0.028 | -0.168 | -0.171 |
| 1.740442330088758 | 1.012 | 0.029 | 0.03 | -0.171 | -0.175 |
| 1.743583922742348 | 1.012 | 0.03 | 0.031 | -0.174 | -0.178 |
| 1.746725515395937 | 1.013 | 0.031 | 0.032 | -0.177 | -0.182 |
| 1.749867108049527 | 1.013 | 0.032 | 0.033 | -0.18 | -0.185 |
| 1.753008700703117 | 1.014 | 0.033 | 0.034 | -0.184 | -0.189 |
| 1.756150293356707 | 1.014 | 0.034 | 0.035 | -0.187 | -0.192 |
| 1.759291886010297 | 1.015 | 0.036 | 0.037 | -0.19 | -0.196 |
| 1.762433478663887 | 1.015 | 0.037 | 0.038 | -0.193 | -0.199 |
| 1.765575071317476 | 1.016 | 0.038 | 0.039 | -0.197 | -0.203 |
| 1.768716663971066 | 1.016 | 0.039 | 0.041 | -0.2 | -0.206 |
| 1.771858256624656 | 1.017 | 0.041 | 0.042 | -0.203 | -0.21 |
| 1.774999849278246 | 1.017 | 0.042 | 0.043 | -0.206 | -0.213 |
| 1.778141441931836 | 1.018 | 0.043 | 0.045 | -0.209 | -0.217 |
| 1.781283034585426 | 1.018 | 0.044 | 0.046 | -0.213 | -0.221 |
| 1.784424627239015 | 1.019 | 0.046 | 0.048 | -0.216 | -0.224 |
| 1.787566219892605 | 1.019 | 0.047 | 0.049 | -0.219 | -0.228 |
| 1.790707812546195 | 1.02 | 0.049 | 0.05 | -0.222 | -0.231 |
| 1.793849405199785 | 1.02 | 0.05 | 0.052 | -0.226 | -0.235 |
| 1.796990997853375 | 1.021 | 0.051 | 0.054 | -0.229 | -0.239 |
| 1.800132590506964 | 1.022 | 0.053 | 0.055 | -0.232 | -0.242 |
| 1.803274183160554 | 1.022 | 0.054 | 0.057 | -0.236 | -0.246 |
| 1.806415775814144 | 1.023 | 0.056 | 0.058 | -0.239 | -0.25 |
| 1.809557368467734 | 1.023 | 0.057 | 0.06 | -0.242 | -0.254 |
| 1.812698961121324 | 1.024 | 0.059 | 0.062 | -0.245 | -0.257 |
| 1.815840553774914 | 1.025 | 0.06 | 0.063 | -0.249 | -0.261 |
| 1.818982146428503 | 1.025 | 0.062 | 0.065 | -0.252 | -0.265 |
| 1.822123739082093 | 1.026 | 0.063 | 0.067 | -0.255 | -0.269 |
| 1.825265331735683 | 1.027 | 0.065 | 0.069 | -0.258 | -0.272 |
| 1.828406924389273 | 1.027 | 0.067 | 0.07 | -0.262 | -0.276 |
| 1.831548517042863 | 1.028 | 0.068 | 0.072 | -0.265 | -0.28 |
| 1.834690109696452 | 1.029 | 0.07 | 0.074 | -0.268 | -0.284 |
| 1.837831702350042 | 1.029 | 0.072 | 0.076 | -0.272 | -0.288 |
| 1.840973295003632 | 1.03 | 0.073 | 0.078 | -0.275 | -0.292 |
| 1.844114887657222 | 1.031 | 0.075 | 0.08 | -0.278 | -0.296 |
| 1.847256480310812 | 1.032 | 0.077 | 0.082 | -0.282 | -0.3 |
| 1.850398072964402 | 1.032 | 0.079 | 0.084 | -0.285 | -0.304 |
| 1.853539665617991 | 1.033 | 0.08 | 0.086 | -0.288 | -0.308 |
| 1.856681258271581 | 1.034 | 0.082 | 0.088 | -0.292 | -0.312 |
| 1.859822850925171 | 1.035 | 0.084 | 0.09 | -0.295 | -0.316 |
| 1.862964443578761 | 1.035 | 0.086 | 0.092 | -0.298 | -0.32 |
| 1.866106036232351 | 1.036 | 0.088 | 0.094 | -0.302 | -0.324 |
| 1.86924762888594 | 1.037 | 0.09 | 0.096 | -0.305 | -0.328 |
| 1.87238922153953 | 1.038 | 0.092 | 0.099 | -0.308 | -0.332 |
| 1.87553081419312 | 1.039 | 0.093 | 0.101 | -0.312 | -0.336 |
| 1.87867240684671 | 1.039 | 0.095 | 0.103 | -0.315 | -0.34 |
| 1.8818139995003 | 1.04 | 0.097 | 0.105 | -0.318 | -0.344 |
| 1.88495559215389 | 1.041 | 0.099 | 0.108 | -0.322 | -0.349 |
| 1.888097184807479 | 1.042 | 0.101 | 0.11 | -0.325 | -0.353 |
| 1.891238777461069 | 1.043 | 0.103 | 0.113 | -0.328 | -0.357 |
| 1.89438037011466 | 1.044 | 0.106 | 0.115 | -0.332 | -0.361 |
| 1.897521962768249 | 1.045 | 0.108 | 0.117 | -0.335 | -0.366 |
| 1.900663555421839 | 1.045 | 0.11 | 0.12 | -0.339 | -0.37 |
| 1.903805148075429 | 1.046 | 0.112 | 0.122 | -0.342 | -0.374 |
| 1.906946740729018 | 1.047 | 0.114 | 0.125 | -0.345 | -0.379 |
| 1.910088333382608 | 1.048 | 0.116 | 0.128 | -0.349 | -0.383 |
| 1.913229926036198 | 1.049 | 0.118 | 0.13 | -0.352 | -0.388 |
| 1.916371518689788 | 1.05 | 0.12 | 0.133 | -0.356 | -0.392 |
| 1.919513111343378 | 1.051 | 0.123 | 0.136 | -0.359 | -0.397 |
| 1.922654703996967 | 1.052 | 0.125 | 0.138 | -0.363 | -0.401 |
| 1.925796296650557 | 1.053 | 0.127 | 0.141 | -0.366 | -0.406 |
| 1.928937889304147 | 1.054 | 0.129 | 0.144 | -0.369 | -0.41 |
| 1.932079481957737 | 1.055 | 0.132 | 0.147 | -0.373 | -0.415 |
| 1.935221074611327 | 1.056 | 0.134 | 0.149 | -0.376 | -0.419 |
| 1.938362667264917 | 1.057 | 0.136 | 0.152 | -0.38 | -0.424 |
| 1.941504259918506 | 1.058 | 0.139 | 0.155 | -0.383 | -0.429 |
| 1.944645852572096 | 1.059 | 0.141 | 0.158 | -0.387 | -0.434 |
| 1.947787445225686 | 1.06 | 0.144 | 0.161 | -0.39 | -0.438 |
| 1.950929037879276 | 1.061 | 0.146 | 0.164 | -0.394 | -0.443 |
| 1.954070630532866 | 1.062 | 0.149 | 0.167 | -0.397 | -0.448 |
| 1.957212223186455 | 1.063 | 0.151 | 0.171 | -0.401 | -0.453 |
| 1.960353815840045 | 1.064 | 0.153 | 0.174 | -0.404 | -0.458 |
| 1.963495408493635 | 1.065 | 0.156 | 0.177 | -0.408 | -0.462 |
| 1.966637001147225 | 1.066 | 0.159 | 0.18 | -0.411 | -0.467 |
| 1.969778593800815 | 1.067 | 0.161 | 0.184 | -0.415 | -0.472 |
| 1.972920186454405 | 1.068 | 0.164 | 0.187 | -0.418 | -0.477 |
| 1.976061779107994 | 1.07 | 0.166 | 0.19 | -0.422 | -0.482 |
| 1.979203371761584 | 1.071 | 0.169 | 0.194 | -0.425 | -0.488 |
| 1.982344964415174 | 1.072 | 0.172 | 0.197 | -0.429 | -0.493 |
| 1.985486557068764 | 1.073 | 0.174 | 0.201 | -0.432 | -0.498 |
| 1.988628149722354 | 1.074 | 0.177 | 0.204 | -0.436 | -0.503 |
| 1.991769742375943 | 1.075 | 0.18 | 0.208 | -0.439 | -0.508 |
| 1.994911335029533 | 1.077 | 0.182 | 0.211 | -0.443 | -0.513 |
| 1.998052927683123 | 1.078 | 0.185 | 0.215 | -0.447 | -0.519 |
| 2.001194520336712 | 1.079 | 0.188 | 0.219 | -0.45 | -0.524 |
| 2.004336112990302 | 1.08 | 0.191 | 0.222 | -0.454 | -0.529 |
| 2.007477705643892 | 1.081 | 0.193 | 0.226 | -0.457 | -0.535 |
| 2.010619298297482 | 1.083 | 0.196 | 0.23 | -0.461 | -0.54 |
| 2.013760890951071 | 1.084 | 0.199 | 0.234 | -0.465 | -0.546 |
| 2.016902483604661 | 1.085 | 0.202 | 0.238 | -0.468 | -0.551 |
| 2.02004407625825 | 1.086 | 0.205 | 0.242 | -0.472 | -0.557 |
| 2.02318566891184 | 1.088 | 0.208 | 0.246 | -0.475 | -0.563 |
| 2.02632726156543 | 1.089 | 0.211 | 0.25 | -0.479 | -0.568 |
| 2.029468854219019 | 1.09 | 0.214 | 0.254 | -0.483 | -0.574 |
| 2.032610446872609 | 1.092 | 0.217 | 0.258 | -0.486 | -0.58 |
| 2.035752039526198 | 1.093 | 0.22 | 0.262 | -0.49 | -0.585 |
| 2.038893632179788 | 1.094 | 0.223 | 0.267 | -0.494 | -0.591 |
| 2.042035224833378 | 1.096 | 0.226 | 0.271 | -0.497 | -0.597 |
| 2.045176817486967 | 1.097 | 0.229 | 0.275 | -0.501 | -0.603 |
| 2.048318410140557 | 1.098 | 0.232 | 0.28 | -0.505 | -0.609 |
| 2.051460002794146 | 1.1 | 0.235 | 0.284 | -0.508 | -0.615 |
| 2.054601595447736 | 1.101 | 0.238 | 0.289 | -0.512 | -0.621 |
| 2.057743188101325 | 1.103 | 0.241 | 0.293 | -0.516 | -0.627 |
| 2.060884780754915 | 1.104 | 0.245 | 0.298 | -0.52 | -0.633 |
| 2.064026373408505 | 1.105 | 0.248 | 0.303 | -0.523 | -0.639 |
| 2.067167966062094 | 1.107 | 0.251 | 0.308 | -0.527 | -0.646 |
| 2.070309558715684 | 1.108 | 0.254 | 0.312 | -0.531 | -0.652 |
| 2.073451151369273 | 1.11 | 0.258 | 0.317 | -0.535 | -0.658 |
| 2.076592744022863 | 1.111 | 0.261 | 0.322 | -0.538 | -0.665 |
| 2.079734336676452 | 1.113 | 0.264 | 0.327 | -0.542 | -0.671 |
| 2.082875929330042 | 1.114 | 0.268 | 0.332 | -0.546 | -0.678 |
| 2.086017521983632 | 1.116 | 0.271 | 0.337 | -0.55 | -0.684 |
| 2.089159114637221 | 1.117 | 0.274 | 0.342 | -0.554 | -0.691 |
| 2.092300707290811 | 1.119 | 0.278 | 0.348 | -0.557 | -0.698 |
| 2.095442299944401 | 1.12 | 0.281 | 0.353 | -0.561 | -0.704 |
| 2.09858389259799 | 1.122 | 0.285 | 0.358 | -0.565 | -0.711 |
| 2.10172548525158 | 1.123 | 0.288 | 0.364 | -0.569 | -0.718 |
| 2.104867077905169 | 1.125 | 0.292 | 0.369 | -0.573 | -0.725 |
| 2.108008670558759 | 1.127 | 0.295 | 0.374 | -0.577 | -0.732 |
| 2.111150263212349 | 1.128 | 0.299 | 0.38 | -0.58 | -0.739 |
| 2.114291855865938 | 1.13 | 0.302 | 0.386 | -0.584 | -0.746 |
| 2.117433448519528 | 1.131 | 0.306 | 0.391 | -0.588 | -0.753 |
| 2.120575041173117 | 1.133 | 0.309 | 0.397 | -0.592 | -0.76 |
| 2.123716633826707 | 1.135 | 0.313 | 0.403 | -0.596 | -0.767 |
| 2.126858226480297 | 1.136 | 0.317 | 0.409 | -0.6 | -0.775 |
| 2.129999819133886 | 1.138 | 0.32 | 0.415 | -0.604 | -0.782 |
| 2.133141411787476 | 1.14 | 0.324 | 0.421 | -0.608 | -0.789 |
| 2.136283004441065 | 1.142 | 0.328 | 0.427 | -0.612 | -0.797 |
| 2.139424597094655 | 1.143 | 0.331 | 0.433 | -0.616 | -0.805 |
| 2.142566189748245 | 1.145 | 0.335 | 0.439 | -0.62 | -0.812 |
| 2.145707782401834 | 1.147 | 0.339 | 0.446 | -0.624 | -0.82 |
| 2.148849375055424 | 1.148 | 0.343 | 0.452 | -0.628 | -0.828 |
| 2.151990967709013 | 1.15 | 0.347 | 0.459 | -0.632 | -0.835 |
| 2.155132560362603 | 1.152 | 0.351 | 0.465 | -0.636 | -0.843 |
| 2.158274153016193 | 1.154 | 0.354 | 0.472 | -0.64 | -0.851 |
| 2.161415745669782 | 1.156 | 0.358 | 0.479 | -0.644 | -0.859 |
| 2.164557338323372 | 1.157 | 0.362 | 0.485 | -0.648 | -0.868 |
| 2.167698930976961 | 1.159 | 0.366 | 0.492 | -0.652 | -0.876 |
| 2.170840523630551 | 1.161 | 0.37 | 0.499 | -0.656 | -0.884 |
| 2.173982116284141 | 1.163 | 0.374 | 0.506 | -0.66 | -0.892 |
| 2.17712370893773 | 1.165 | 0.378 | 0.513 | -0.664 | -0.901 |
| 2.18026530159132 | 1.167 | 0.382 | 0.52 | -0.668 | -0.909 |
| 2.183406894244909 | 1.169 | 0.386 | 0.528 | -0.672 | -0.918 |
| 2.186548486898499 | 1.171 | 0.39 | 0.535 | -0.676 | -0.926 |
| 2.189690079552089 | 1.173 | 0.395 | 0.543 | -0.68 | -0.935 |
| 2.192831672205678 | 1.174 | 0.399 | 0.55 | -0.684 | -0.944 |
| 2.195973264859268 | 1.176 | 0.403 | 0.558 | -0.688 | -0.953 |
| 2.199114857512857 | 1.178 | 0.407 | 0.565 | -0.693 | -0.962 |
| 2.202256450166447 | 1.18 | 0.411 | 0.573 | -0.697 | -0.971 |
| 2.205398042820036 | 1.182 | 0.416 | 0.581 | -0.701 | -0.98 |
| 2.208539635473626 | 1.184 | 0.42 | 0.589 | -0.705 | -0.989 |
| 2.211681228127216 | 1.186 | 0.424 | 0.597 | -0.709 | -0.998 |
| 2.214822820780805 | 1.188 | 0.428 | 0.605 | -0.714 | -1.008 |
| 2.217964413434395 | 1.191 | 0.433 | 0.613 | -0.718 | -1.017 |
| 2.221106006087984 | 1.193 | 0.437 | 0.622 | -0.722 | -1.027 |
| 2.224247598741574 | 1.195 | 0.442 | 0.63 | -0.726 | -1.037 |
| 2.227389191395164 | 1.197 | 0.446 | 0.639 | -0.731 | -1.046 |
| 2.230530784048753 | 1.199 | 0.45 | 0.647 | -0.735 | -1.056 |
| 2.233672376702343 | 1.201 | 0.455 | 0.656 | -0.739 | -1.066 |
| 2.236813969355933 | 1.203 | 0.459 | 0.665 | -0.743 | -1.076 |
| 2.239955562009522 | 1.205 | 0.464 | 0.674 | -0.748 | -1.086 |
| 2.243097154663112 | 1.208 | 0.468 | 0.683 | -0.752 | -1.097 |
| 2.246238747316701 | 1.21 | 0.473 | 0.692 | -0.756 | -1.107 |
| 2.249380339970291 | 1.212 | 0.477 | 0.701 | -0.761 | -1.117 |
| 2.252521932623881 | 1.214 | 0.482 | 0.711 | -0.765 | -1.128 |
| 2.25566352527747 | 1.216 | 0.487 | 0.72 | -0.769 | -1.138 |
| 2.25880511793106 | 1.219 | 0.491 | 0.73 | -0.774 | -1.149 |
| 2.261946710584649 | 1.221 | 0.496 | 0.739 | -0.778 | -1.16 |
| 2.265088303238239 | 1.223 | 0.501 | 0.749 | -0.783 | -1.171 |
| 2.268229895891829 | 1.225 | 0.505 | 0.759 | -0.787 | -1.182 |
| 2.271371488545418 | 1.228 | 0.51 | 0.769 | -0.791 | -1.193 |
| 2.274513081199008 | 1.23 | 0.515 | 0.779 | -0.796 | -1.204 |
| 2.277654673852597 | 1.232 | 0.52 | 0.79 | -0.8 | -1.216 |
| 2.280796266506186 | 1.235 | 0.525 | 0.8 | -0.805 | -1.227 |
| 2.283937859159776 | 1.237 | 0.53 | 0.81 | -0.809 | -1.239 |
| 2.287079451813366 | 1.24 | 0.534 | 0.821 | -0.814 | -1.251 |
| 2.290221044466955 | 1.242 | 0.539 | 0.832 | -0.818 | -1.262 |
| 2.293362637120545 | 1.244 | 0.544 | 0.843 | -0.823 | -1.274 |
| 2.296504229774135 | 1.247 | 0.549 | 0.854 | -0.827 | -1.286 |
| 2.299645822427724 | 1.249 | 0.554 | 0.865 | -0.832 | -1.299 |
| 2.302787415081314 | 1.252 | 0.559 | 0.876 | -0.837 | -1.311 |
| 2.305929007734904 | 1.254 | 0.564 | 0.888 | -0.841 | -1.323 |
| 2.309070600388493 | 1.257 | 0.569 | 0.899 | -0.846 | -1.336 |
| 2.312212193042083 | 1.259 | 0.574 | 0.911 | -0.85 | -1.349 |
| 2.315353785695672 | 1.262 | 0.579 | 0.923 | -0.855 | -1.362 |
| 2.318495378349262 | 1.264 | 0.585 | 0.935 | -0.86 | -1.374 |
| 2.321636971002852 | 1.267 | 0.59 | 0.947 | -0.864 | -1.388 |
| 2.324778563656441 | 1.27 | 0.595 | 0.959 | -0.869 | -1.401 |
| 2.327920156310031 | 1.272 | 0.6 | 0.971 | -0.874 | -1.414 |
| 2.33106174896362 | 1.275 | 0.605 | 0.984 | -0.878 | -1.428 |
| 2.33420334161721 | 1.277 | 0.611 | 0.996 | -0.883 | -1.441 |
| 2.3373449342708 | 1.28 | 0.616 | 1.009 | -0.888 | -1.455 |
| 2.340486526924389 | 1.283 | 0.621 | 1.022 | -0.893 | -1.469 |
| 2.343628119577979 | 1.285 | 0.627 | 1.035 | -0.897 | -1.483 |
| 2.346769712231568 | 1.288 | 0.632 | 1.049 | -0.902 | -1.497 |
| 2.349911304885158 | 1.291 | 0.637 | 1.062 | -0.907 | -1.512 |
| 2.353052897538748 | 1.294 | 0.643 | 1.076 | -0.912 | -1.526 |
| 2.356194490192337 | 1.296 | 0.648 | 1.089 | -0.917 | -1.541 |
| 2.359336082845927 | 1.299 | 0.654 | 1.103 | -0.922 | -1.555 |
| 2.362477675499516 | 1.302 | 0.659 | 1.117 | -0.926 | -1.57 |
| 2.365619268153106 | 1.305 | 0.665 | 1.132 | -0.931 | -1.586 |
| 2.368760860806696 | 1.308 | 0.67 | 1.146 | -0.936 | -1.601 |
| 2.371902453460285 | 1.31 | 0.676 | 1.161 | -0.941 | -1.616 |
| 2.375044046113875 | 1.313 | 0.681 | 1.175 | -0.946 | -1.632 |
| 2.378185638767464 | 1.316 | 0.687 | 1.19 | -0.951 | -1.648 |
| 2.381327231421054 | 1.319 | 0.693 | 1.205 | -0.956 | -1.664 |
| 2.384468824074644 | 1.322 | 0.698 | 1.221 | -0.961 | -1.68 |
| 2.387610416728233 | 1.325 | 0.704 | 1.236 | -0.966 | -1.696 |
| 2.390752009381823 | 1.328 | 0.71 | 1.252 | -0.971 | -1.712 |
| 2.393893602035412 | 1.331 | 0.716 | 1.268 | -0.976 | -1.729 |
| 2.397035194689002 | 1.334 | 0.721 | 1.284 | -0.981 | -1.746 |
| 2.400176787342591 | 1.337 | 0.727 | 1.3 | -0.986 | -1.763 |
| 2.403318379996181 | 1.34 | 0.733 | 1.316 | -0.991 | -1.78 |
| 2.406459972649771 | 1.343 | 0.739 | 1.333 | -0.996 | -1.797 |
| 2.40960156530336 | 1.346 | 0.745 | 1.35 | -1.001 | -1.815 |
| 2.41274315795695 | 1.349 | 0.751 | 1.367 | -1.006 | -1.832 |
| 2.41588475061054 | 1.352 | 0.757 | 1.384 | -1.012 | -1.85 |
| 2.419026343264129 | 1.356 | 0.763 | 1.401 | -1.017 | -1.868 |
| 2.422167935917719 | 1.359 | 0.769 | 1.419 | -1.022 | -1.887 |
| 2.425309528571308 | 1.362 | 0.775 | 1.437 | -1.027 | -1.905 |
| 2.428451121224898 | 1.365 | 0.781 | 1.455 | -1.032 | -1.924 |
| 2.431592713878488 | 1.368 | 0.787 | 1.473 | -1.038 | -1.943 |
| 2.434734306532077 | 1.371 | 0.793 | 1.492 | -1.043 | -1.962 |
| 2.437875899185667 | 1.375 | 0.799 | 1.51 | -1.048 | -1.981 |
| 2.441017491839256 | 1.378 | 0.805 | 1.529 | -1.053 | -2 |
| 2.444159084492846 | 1.381 | 0.812 | 1.548 | -1.059 | -2.02 |
| 2.447300677146435 | 1.385 | 0.818 | 1.568 | -1.064 | -2.04 |
| 2.450442269800025 | 1.388 | 0.824 | 1.587 | -1.069 | -2.06 |
| 2.453583862453615 | 1.391 | 0.83 | 1.607 | -1.075 | -2.08 |
| 2.456725455107204 | 1.395 | 0.837 | 1.627 | -1.08 | -2.101 |
| 2.459867047760794 | 1.398 | 0.843 | 1.648 | -1.086 | -2.122 |
| 2.463008640414384 | 1.401 | 0.849 | 1.668 | -1.091 | -2.143 |
| 2.466150233067973 | 1.405 | 0.856 | 1.689 | -1.096 | -2.164 |
| 2.469291825721563 | 1.408 | 0.862 | 1.71 | -1.102 | -2.186 |
| 2.472433418375152 | 1.412 | 0.869 | 1.731 | -1.107 | -2.207 |
| 2.475575011028742 | 1.415 | 0.875 | 1.753 | -1.113 | -2.229 |
| 2.478716603682332 | 1.419 | 0.882 | 1.775 | -1.118 | -2.251 |
| 2.481858196335921 | 1.422 | 0.888 | 1.797 | -1.124 | -2.274 |
| 2.48499978898951 | 1.426 | 0.895 | 1.819 | -1.129 | -2.296 |
| 2.4881413816431 | 1.43 | 0.901 | 1.842 | -1.135 | -2.319 |
| 2.49128297429669 | 1.433 | 0.908 | 1.864 | -1.141 | -2.343 |
| 2.49442456695028 | 1.437 | 0.914 | 1.888 | -1.146 | -2.366 |
| 2.497566159603869 | 1.44 | 0.921 | 1.911 | -1.152 | -2.39 |
| 2.500707752257458 | 1.444 | 0.928 | 1.935 | -1.157 | -2.414 |
| 2.503849344911048 | 1.448 | 0.935 | 1.959 | -1.163 | -2.438 |
| 2.506990937564638 | 1.451 | 0.941 | 1.983 | -1.169 | -2.462 |
| 2.510132530218228 | 1.455 | 0.948 | 2.007 | -1.175 | -2.487 |
| 2.513274122871817 | 1.459 | 0.955 | 2.032 | -1.18 | -2.512 |
| 2.516415715525407 | 1.463 | 0.962 | 2.057 | -1.186 | -2.537 |
| 2.519557308178996 | 1.466 | 0.969 | 2.083 | -1.192 | -2.563 |
| 2.522698900832586 | 1.47 | 0.975 | 2.109 | -1.198 | -2.589 |
| 2.525840493486176 | 1.474 | 0.982 | 2.135 | -1.203 | -2.615 |
| 2.528982086139765 | 1.478 | 0.989 | 2.161 | -1.209 | -2.641 |
| 2.532123678793355 | 1.482 | 0.996 | 2.188 | -1.215 | -2.668 |
| 2.535265271446944 | 1.486 | 1.003 | 2.215 | -1.221 | -2.695 |
| 2.538406864100534 | 1.49 | 1.01 | 2.242 | -1.227 | -2.722 |
| 2.541548456754124 | 1.494 | 1.017 | 2.269 | -1.233 | -2.75 |
| 2.544690049407713 | 1.498 | 1.024 | 2.297 | -1.239 | -2.778 |
| 2.547831642061302 | 1.502 | 1.032 | 2.326 | -1.245 | -2.806 |
| 2.550973234714892 | 1.506 | 1.039 | 2.354 | -1.25 | -2.834 |
| 2.554114827368482 | 1.51 | 1.046 | 2.383 | -1.256 | -2.863 |
| 2.557256420022072 | 1.514 | 1.053 | 2.412 | -1.262 | -2.892 |
| 2.560398012675661 | 1.518 | 1.06 | 2.442 | -1.268 | -2.922 |
| 2.563539605329251 | 1.522 | 1.067 | 2.472 | -1.275 | -2.951 |
| 2.56668119798284 | 1.526 | 1.075 | 2.502 | -1.281 | -2.982 |
| 2.56982279063643 | 1.53 | 1.082 | 2.533 | -1.287 | -3.012 |
| 2.57296438329002 | 1.534 | 1.089 | 2.564 | -1.293 | -3.043 |
| 2.576105975943609 | 1.538 | 1.097 | 2.595 | -1.299 | -3.074 |
| 2.579247568597199 | 1.543 | 1.104 | 2.627 | -1.305 | -3.105 |
| 2.582389161250788 | 1.547 | 1.111 | 2.659 | -1.311 | -3.137 |
| 2.585530753904377 | 1.551 | 1.119 | 2.692 | -1.317 | -3.169 |
| 2.588672346557967 | 1.555 | 1.126 | 2.725 | -1.324 | -3.202 |
| 2.591813939211557 | 1.56 | 1.134 | 2.758 | -1.33 | -3.234 |
| 2.594955531865147 | 1.564 | 1.141 | 2.791 | -1.336 | -3.268 |
| 2.598097124518736 | 1.568 | 1.149 | 2.825 | -1.342 | -3.301 |
| 2.601238717172326 | 1.573 | 1.156 | 2.86 | -1.349 | -3.335 |
| 2.604380309825915 | 1.577 | 1.164 | 2.895 | -1.355 | -3.369 |
| 2.607521902479505 | 1.581 | 1.172 | 2.93 | -1.361 | -3.404 |
| 2.610663495133095 | 1.586 | 1.179 | 2.965 | -1.367 | -3.439 |
| 2.613805087786684 | 1.59 | 1.187 | 3.001 | -1.374 | -3.474 |
| 2.616946680440274 | 1.595 | 1.195 | 3.038 | -1.38 | -3.51 |
| 2.620088273093863 | 1.599 | 1.202 | 3.075 | -1.387 | -3.546 |
| 2.623229865747452 | 1.604 | 1.21 | 3.112 | -1.393 | -3.582 |
| 2.626371458401042 | 1.608 | 1.218 | 3.149 | -1.399 | -3.619 |
| 2.629513051054632 | 1.613 | 1.226 | 3.188 | -1.406 | -3.657 |
| 2.632654643708222 | 1.617 | 1.233 | 3.226 | -1.412 | -3.694 |
| 2.635796236361811 | 1.622 | 1.241 | 3.265 | -1.419 | -3.732 |
| 2.638937829015401 | 1.627 | 1.249 | 3.304 | -1.425 | -3.771 |
| 2.642079421668991 | 1.631 | 1.257 | 3.344 | -1.432 | -3.81 |
| 2.64522101432258 | 1.636 | 1.265 | 3.384 | -1.438 | -3.849 |
| 2.64836260697617 | 1.64 | 1.273 | 3.425 | -1.445 | -3.889 |
| 2.651504199629759 | 1.645 | 1.281 | 3.466 | -1.452 | -3.929 |
| 2.654645792283349 | 1.65 | 1.289 | 3.508 | -1.458 | -3.969 |
| 2.657787384936938 | 1.655 | 1.297 | 3.55 | -1.465 | -4.01 |
| 2.660928977590528 | 1.659 | 1.305 | 3.592 | -1.471 | -4.051 |
| 2.664070570244118 | 1.664 | 1.313 | 3.635 | -1.478 | -4.093 |
| 2.667212162897707 | 1.669 | 1.321 | 3.679 | -1.485 | -4.135 |
| 2.670353755551297 | 1.674 | 1.329 | 3.723 | -1.491 | -4.178 |
| 2.673495348204887 | 1.679 | 1.337 | 3.767 | -1.498 | -4.221 |
| 2.676636940858476 | 1.683 | 1.345 | 3.812 | -1.505 | -4.265 |
| 2.679778533512066 | 1.688 | 1.353 | 3.857 | -1.511 | -4.309 |
| 2.682920126165655 | 1.693 | 1.361 | 3.903 | -1.518 | -4.353 |
| 2.686061718819245 | 1.698 | 1.369 | 3.949 | -1.525 | -4.398 |
| 2.689203311472835 | 1.703 | 1.378 | 3.996 | -1.532 | -4.443 |
| 2.692344904126424 | 1.708 | 1.386 | 4.043 | -1.539 | -4.489 |
| 2.695486496780014 | 1.713 | 1.394 | 4.091 | -1.545 | -4.535 |
| 2.698628089433603 | 1.718 | 1.402 | 4.139 | -1.552 | -4.581 |
| 2.701769682087193 | 1.723 | 1.411 | 4.188 | -1.559 | -4.628 |
| 2.704911274740782 | 1.728 | 1.419 | 4.237 | -1.566 | -4.676 |
| 2.708052867394372 | 1.733 | 1.427 | 4.287 | -1.573 | -4.724 |
| 2.711194460047962 | 1.738 | 1.436 | 4.337 | -1.58 | -4.772 |
| 2.714336052701551 | 1.743 | 1.444 | 4.388 | -1.586 | -4.821 |
| 2.717477645355141 | 1.748 | 1.452 | 4.439 | -1.593 | -4.87 |
| 2.720619238008731 | 1.753 | 1.461 | 4.49 | -1.6 | -4.92 |
| 2.72376083066232 | 1.759 | 1.469 | 4.543 | -1.607 | -4.97 |
| 2.72690242331591 | 1.764 | 1.477 | 4.595 | -1.614 | -5.021 |
| 2.730044015969499 | 1.769 | 1.486 | 4.649 | -1.621 | -5.072 |
| 2.733185608623089 | 1.774 | 1.494 | 4.702 | -1.628 | -5.124 |
| 2.736327201276678 | 1.779 | 1.503 | 4.756 | -1.635 | -5.176 |
| 2.739468793930268 | 1.784 | 1.511 | 4.811 | -1.642 | -5.228 |
| 2.742610386583858 | 1.79 | 1.52 | 4.866 | -1.649 | -5.281 |
| 2.745751979237447 | 1.795 | 1.528 | 4.922 | -1.656 | -5.335 |
| 2.748893571891036 | 1.8 | 1.536 | 4.978 | -1.663 | -5.389 |
| 2.752035164544627 | 1.805 | 1.545 | 5.035 | -1.67 | -5.443 |
| 2.755176757198216 | 1.811 | 1.553 | 5.092 | -1.677 | -5.498 |
| 2.758318349851806 | 1.816 | 1.562 | 5.15 | -1.684 | -5.553 |
| 2.761459942505395 | 1.821 | 1.57 | 5.208 | -1.691 | -5.609 |
| 2.764601535158985 | 1.826 | 1.579 | 5.267 | -1.698 | -5.665 |
| 2.767743127812574 | 1.832 | 1.587 | 5.326 | -1.705 | -5.722 |
| 2.770884720466164 | 1.837 | 1.596 | 5.386 | -1.712 | -5.779 |
| 2.774026313119754 | 1.842 | 1.605 | 5.446 | -1.719 | -5.836 |
| 2.777167905773343 | 1.848 | 1.613 | 5.507 | -1.726 | -5.894 |
| 2.780309498426932 | 1.853 | 1.622 | 5.568 | -1.733 | -5.953 |
| 2.783451091080522 | 1.858 | 1.63 | 5.63 | -1.741 | -6.012 |
| 2.786592683734112 | 1.864 | 1.639 | 5.692 | -1.748 | -6.071 |
| 2.789734276387701 | 1.869 | 1.647 | 5.755 | -1.755 | -6.131 |
| 2.792875869041291 | 1.875 | 1.656 | 5.818 | -1.762 | -6.191 |
| 2.796017461694881 | 1.88 | 1.664 | 5.882 | -1.769 | -6.252 |
| 2.79915905434847 | 1.885 | 1.673 | 5.946 | -1.776 | -6.313 |
| 2.80230064700206 | 1.891 | 1.681 | 6.011 | -1.783 | -6.374 |
| 2.80544223965565 | 1.896 | 1.69 | 6.076 | -1.79 | -6.436 |
| 2.808583832309239 | 1.902 | 1.698 | 6.141 | -1.797 | -6.498 |
| 2.811725424962829 | 1.907 | 1.707 | 6.207 | -1.804 | -6.561 |
| 2.814867017616419 | 1.912 | 1.715 | 6.274 | -1.811 | -6.624 |
| 2.818008610270008 | 1.918 | 1.724 | 6.34 | -1.818 | -6.687 |
| 2.821150202923598 | 1.923 | 1.732 | 6.408 | -1.825 | -6.751 |
| 2.824291795577187 | 1.929 | 1.741 | 6.475 | -1.832 | -6.815 |
| 2.827433388230777 | 1.934 | 1.749 | 6.543 | -1.839 | -6.88 |
| 2.830574980884366 | 1.939 | 1.758 | 6.612 | -1.846 | -6.945 |
| 2.833716573537956 | 1.945 | 1.766 | 6.681 | -1.853 | -7.01 |
| 2.836858166191546 | 1.95 | 1.775 | 6.75 | -1.86 | -7.076 |
| 2.839999758845135 | 1.956 | 1.783 | 6.819 | -1.867 | -7.142 |
| 2.843141351498725 | 1.961 | 1.791 | 6.889 | -1.874 | -7.208 |
| 2.846282944152314 | 1.966 | 1.8 | 6.96 | -1.881 | -7.275 |
| 2.849424536805904 | 1.972 | 1.808 | 7.03 | -1.888 | -7.342 |
| 2.852566129459494 | 1.977 | 1.817 | 7.102 | -1.895 | -7.409 |
| 2.855707722113083 | 1.983 | 1.825 | 7.173 | -1.902 | -7.476 |
| 2.858849314766673 | 1.988 | 1.833 | 7.244 | -1.909 | -7.544 |
| 2.861990907420262 | 1.993 | 1.841 | 7.316 | -1.916 | -7.612 |
| 2.865132500073852 | 1.999 | 1.85 | 7.389 | -1.923 | -7.68 |
| 2.868274092727442 | 2.004 | 1.858 | 7.461 | -1.93 | -7.749 |
| 2.871415685381031 | 2.009 | 1.866 | 7.534 | -1.936 | -7.817 |
| 2.874557278034621 | 2.015 | 1.874 | 7.607 | -1.943 | -7.886 |
| 2.87769887068821 | 2.02 | 1.882 | 7.68 | -1.95 | -7.955 |
| 2.8808404633418 | 2.025 | 1.891 | 7.753 | -1.957 | -8.024 |
| 2.88398205599539 | 2.03 | 1.899 | 7.827 | -1.963 | -8.094 |
| 2.88712364864898 | 2.036 | 1.907 | 7.901 | -1.97 | -8.163 |
| 2.890265241302569 | 2.041 | 1.915 | 7.974 | -1.977 | -8.233 |
| 2.893406833956158 | 2.046 | 1.923 | 8.048 | -1.983 | -8.303 |
| 2.896548426609748 | 2.051 | 1.93 | 8.122 | -1.99 | -8.373 |
| 2.899690019263338 | 2.056 | 1.938 | 8.197 | -1.996 | -8.443 |
| 2.902831611916927 | 2.062 | 1.946 | 8.271 | -2.003 | -8.512 |
| 2.905973204570517 | 2.067 | 1.954 | 8.345 | -2.01 | -8.582 |
| 2.909114797224106 | 2.072 | 1.962 | 8.42 | -2.016 | -8.652 |
| 2.912256389877696 | 2.077 | 1.969 | 8.494 | -2.022 | -8.722 |
| 2.915397982531286 | 2.082 | 1.977 | 8.568 | -2.029 | -8.792 |
| 2.918539575184875 | 2.087 | 1.985 | 8.643 | -2.035 | -8.862 |
| 2.921681167838465 | 2.092 | 1.992 | 8.717 | -2.041 | -8.932 |
| 2.924822760492054 | 2.097 | 2 | 8.791 | -2.048 | -9.002 |
| 2.927964353145644 | 2.102 | 2.007 | 8.865 | -2.054 | -9.071 |
| 2.931105945799234 | 2.107 | 2.015 | 8.939 | -2.06 | -9.141 |
| 2.934247538452823 | 2.111 | 2.022 | 9.013 | -2.066 | -9.21 |
| 2.937389131106413 | 2.116 | 2.029 | 9.087 | -2.072 | -9.279 |
| 2.940530723760002 | 2.121 | 2.036 | 9.16 | -2.078 | -9.348 |
| 2.943672316413592 | 2.126 | 2.043 | 9.233 | -2.084 | -9.417 |
| 2.946813909067182 | 2.13 | 2.051 | 9.306 | -2.09 | -9.485 |
| 2.949955501720771 | 2.135 | 2.058 | 9.379 | -2.096 | -9.554 |
| 2.953097094374361 | 2.14 | 2.064 | 9.451 | -2.102 | -9.621 |
| 2.95623868702795 | 2.144 | 2.071 | 9.523 | -2.107 | -9.689 |
| 2.95938027968154 | 2.149 | 2.078 | 9.594 | -2.113 | -9.756 |
| 2.96252187233513 | 2.153 | 2.085 | 9.666 | -2.119 | -9.823 |
| 2.965663464988719 | 2.158 | 2.092 | 9.736 | -2.124 | -9.889 |
| 2.968805057642309 | 2.162 | 2.098 | 9.807 | -2.13 | -9.955 |
| 2.971946650295898 | 2.166 | 2.105 | 9.876 | -2.135 | -10.02 |
| 2.975088242949488 | 2.171 | 2.111 | 9.946 | -2.141 | -10.085 |
| 2.978229835603078 | 2.175 | 2.117 | 10.014 | -2.146 | -10.149 |
| 2.981371428256667 | 2.179 | 2.124 | 10.082 | -2.151 | -10.213 |
| 2.984513020910257 | 2.183 | 2.13 | 10.15 | -2.156 | -10.276 |
| 2.987654613563846 | 2.187 | 2.136 | 10.217 | -2.161 | -10.339 |
| 2.990796206217436 | 2.191 | 2.142 | 10.283 | -2.166 | -10.401 |
| 2.993937798871025 | 2.195 | 2.148 | 10.348 | -2.171 | -10.462 |
| 2.997079391524615 | 2.199 | 2.153 | 10.413 | -2.176 | -10.523 |
| 3.000220984178205 | 2.203 | 2.159 | 10.477 | -2.181 | -10.583 |
| 3.003362576831794 | 2.207 | 2.165 | 10.54 | -2.186 | -10.642 |
| 3.006504169485384 | 2.21 | 2.17 | 10.602 | -2.19 | -10.7 |
| 3.009645762138974 | 2.214 | 2.176 | 10.664 | -2.195 | -10.757 |
| 3.012787354792563 | 2.217 | 2.181 | 10.724 | -2.199 | -10.814 |
| 3.015928947446153 | 2.221 | 2.186 | 10.784 | -2.203 | -10.869 |
| 3.019070540099742 | 2.224 | 2.191 | 10.842 | -2.208 | -10.924 |
| 3.022212132753332 | 2.228 | 2.196 | 10.9 | -2.212 | -10.978 |
| 3.025353725406922 | 2.231 | 2.201 | 10.956 | -2.216 | -11.031 |
| 3.028495318060511 | 2.234 | 2.206 | 11.012 | -2.22 | -11.083 |
| 3.031636910714101 | 2.237 | 2.211 | 11.066 | -2.224 | -11.133 |
| 3.03477850336769 | 2.241 | 2.215 | 11.119 | -2.228 | -11.183 |
| 3.03792009602128 | 2.244 | 2.219 | 11.171 | -2.231 | -11.232 |
| 3.04106168867487 | 2.246 | 2.224 | 11.222 | -2.235 | -11.279 |
| 3.04420328132846 | 2.249 | 2.228 | 11.272 | -2.239 | -11.326 |
| 3.047344873982049 | 2.252 | 2.232 | 11.32 | -2.242 | -11.371 |
| 3.050486466635638 | 2.255 | 2.236 | 11.368 | -2.245 | -11.415 |
| 3.053628059289228 | 2.257 | 2.24 | 11.413 | -2.249 | -11.458 |
| 3.056769651942818 | 2.26 | 2.244 | 11.458 | -2.252 | -11.499 |
| 3.059911244596407 | 2.262 | 2.247 | 11.501 | -2.255 | -11.54 |
| 3.063052837249997 | 2.265 | 2.251 | 11.543 | -2.258 | -11.579 |
| 3.066194429903586 | 2.267 | 2.254 | 11.583 | -2.26 | -11.616 |
| 3.069336022557176 | 2.269 | 2.257 | 11.622 | -2.263 | -11.652 |
| 3.072477615210766 | 2.271 | 2.26 | 11.66 | -2.266 | -11.687 |
| 3.075619207864355 | 2.273 | 2.263 | 11.695 | -2.268 | -11.721 |
| 3.078760800517945 | 2.275 | 2.266 | 11.73 | -2.271 | -11.753 |
| 3.081902393171534 | 2.277 | 2.269 | 11.763 | -2.273 | -11.784 |
| 3.085043985825124 | 2.279 | 2.271 | 11.794 | -2.275 | -11.813 |
| 3.088185578478713 | 2.28 | 2.274 | 11.824 | -2.277 | -11.841 |
| 3.091327171132303 | 2.282 | 2.276 | 11.852 | -2.279 | -11.867 |
| 3.094468763785893 | 2.283 | 2.278 | 11.879 | -2.281 | -11.892 |
| 3.097610356439482 | 2.285 | 2.28 | 11.904 | -2.283 | -11.915 |
| 3.100751949093072 | 2.286 | 2.282 | 11.927 | -2.284 | -11.937 |
| 3.103893541746661 | 2.287 | 2.284 | 11.949 | -2.286 | -11.957 |
| 3.107035134400251 | 2.288 | 2.286 | 11.969 | -2.287 | -11.976 |
| 3.110176727053841 | 2.289 | 2.287 | 11.987 | -2.288 | -11.993 |
| 3.11331831970743 | 2.29 | 2.288 | 12.003 | -2.289 | -12.008 |
| 3.11645991236102 | 2.291 | 2.29 | 12.018 | -2.29 | -12.022 |
| 3.11960150501461 | 2.292 | 2.291 | 12.031 | -2.291 | -12.034 |
| 3.122743097668199 | 2.292 | 2.292 | 12.043 | -2.292 | -12.045 |
| 3.125884690321789 | 2.293 | 2.292 | 12.053 | -2.293 | -12.054 |
| 3.129026282975378 | 2.293 | 2.293 | 12.06 | -2.293 | -12.061 |
| 3.132167875628968 | 2.294 | 2.294 | 12.067 | -2.294 | -12.067 |
| 3.135309468282557 | 2.294 | 2.294 | 12.071 | -2.294 | -12.071 |
| 3.138451060936147 | 2.294 | 2.294 | 12.074 | -2.294 | -12.074 |
| 3.141592653589737 | 2.294 | 2.294 | 12.075 | -2.294 | -12.075 |
| 3.144734246243326 | 2.294 | 2.294 | 12.074 | -2.294 | -12.074 |
| 3.147875838896916 | 2.294 | 2.294 | 12.071 | -2.294 | -12.071 |
| 3.151017431550505 | 2.294 | 2.294 | 12.067 | -2.294 | -12.067 |
| 3.154159024204095 | 2.293 | 2.293 | 12.06 | -2.293 | -12.061 |
| 3.157300616857685 | 2.293 | 2.292 | 12.053 | -2.293 | -12.054 |
| 3.160442209511274 | 2.292 | 2.292 | 12.043 | -2.292 | -12.045 |
| 3.163583802164864 | 2.292 | 2.291 | 12.031 | -2.291 | -12.034 |
| 3.166725394818453 | 2.291 | 2.29 | 12.018 | -2.29 | -12.022 |
| 3.169866987472043 | 2.29 | 2.288 | 12.003 | -2.289 | -12.008 |
| 3.173008580125633 | 2.289 | 2.287 | 11.987 | -2.288 | -11.993 |
| 3.176150172779222 | 2.288 | 2.286 | 11.969 | -2.287 | -11.976 |
| 3.179291765432812 | 2.287 | 2.284 | 11.949 | -2.286 | -11.957 |
| 3.182433358086401 | 2.286 | 2.282 | 11.927 | -2.284 | -11.937 |
| 3.185574950739991 | 2.285 | 2.28 | 11.904 | -2.283 | -11.915 |
| 3.188716543393581 | 2.283 | 2.278 | 11.879 | -2.281 | -11.892 |
| 3.19185813604717 | 2.282 | 2.276 | 11.852 | -2.279 | -11.867 |
| 3.19499972870076 | 2.28 | 2.274 | 11.824 | -2.277 | -11.841 |
| 3.198141321354349 | 2.279 | 2.271 | 11.794 | -2.275 | -11.813 |
| 3.20128291400794 | 2.277 | 2.269 | 11.763 | -2.273 | -11.784 |
| 3.204424506661528 | 2.275 | 2.266 | 11.73 | -2.271 | -11.753 |
| 3.207566099315118 | 2.273 | 2.263 | 11.695 | -2.268 | -11.721 |
| 3.210707691968708 | 2.271 | 2.26 | 11.66 | -2.266 | -11.687 |
| 3.213849284622297 | 2.269 | 2.257 | 11.622 | -2.263 | -11.652 |
| 3.216990877275887 | 2.267 | 2.254 | 11.583 | -2.26 | -11.616 |
| 3.220132469929476 | 2.265 | 2.251 | 11.543 | -2.258 | -11.579 |
| 3.223274062583066 | 2.262 | 2.247 | 11.501 | -2.255 | -11.54 |
| 3.226415655236656 | 2.26 | 2.244 | 11.458 | -2.252 | -11.499 |
| 3.229557247890245 | 2.257 | 2.24 | 11.413 | -2.249 | -11.458 |
| 3.232698840543835 | 2.255 | 2.236 | 11.368 | -2.245 | -11.415 |
| 3.235840433197425 | 2.252 | 2.232 | 11.32 | -2.242 | -11.371 |
| 3.238982025851014 | 2.249 | 2.228 | 11.272 | -2.239 | -11.326 |
| 3.242123618504604 | 2.246 | 2.224 | 11.222 | -2.235 | -11.279 |
| 3.245265211158193 | 2.244 | 2.219 | 11.171 | -2.231 | -11.232 |
| 3.248406803811783 | 2.241 | 2.215 | 11.119 | -2.228 | -11.183 |
| 3.251548396465373 | 2.237 | 2.211 | 11.066 | -2.224 | -11.133 |
| 3.254689989118962 | 2.234 | 2.206 | 11.012 | -2.22 | -11.083 |
| 3.257831581772551 | 2.231 | 2.201 | 10.956 | -2.216 | -11.031 |
| 3.260973174426141 | 2.228 | 2.196 | 10.9 | -2.212 | -10.978 |
| 3.26411476707973 | 2.224 | 2.191 | 10.842 | -2.208 | -10.924 |
| 3.267256359733321 | 2.221 | 2.186 | 10.784 | -2.203 | -10.869 |
| 3.27039795238691 | 2.217 | 2.181 | 10.724 | -2.199 | -10.814 |
| 3.2735395450405 | 2.214 | 2.176 | 10.664 | -2.195 | -10.757 |
| 3.276681137694089 | 2.21 | 2.17 | 10.602 | -2.19 | -10.7 |
| 3.279822730347679 | 2.207 | 2.165 | 10.54 | -2.186 | -10.642 |
| 3.282964323001269 | 2.203 | 2.159 | 10.477 | -2.181 | -10.583 |
| 3.286105915654858 | 2.199 | 2.153 | 10.413 | -2.176 | -10.523 |
| 3.289247508308448 | 2.195 | 2.148 | 10.348 | -2.171 | -10.462 |
| 3.292389100962037 | 2.191 | 2.142 | 10.283 | -2.166 | -10.401 |
| 3.295530693615627 | 2.187 | 2.136 | 10.217 | -2.161 | -10.339 |
| 3.298672286269217 | 2.183 | 2.13 | 10.15 | -2.156 | -10.276 |
| 3.301813878922806 | 2.179 | 2.124 | 10.082 | -2.151 | -10.213 |
| 3.304955471576396 | 2.175 | 2.117 | 10.014 | -2.146 | -10.149 |
| 3.308097064229985 | 2.171 | 2.111 | 9.946 | -2.141 | -10.085 |
| 3.311238656883575 | 2.166 | 2.105 | 9.876 | -2.135 | -10.02 |
| 3.314380249537165 | 2.162 | 2.098 | 9.807 | -2.13 | -9.955 |
| 3.317521842190754 | 2.158 | 2.092 | 9.736 | -2.124 | -9.889 |
| 3.320663434844344 | 2.153 | 2.085 | 9.666 | -2.119 | -9.823 |
| 3.323805027497933 | 2.149 | 2.078 | 9.594 | -2.113 | -9.756 |
| 3.326946620151523 | 2.144 | 2.071 | 9.523 | -2.107 | -9.689 |
| 3.330088212805113 | 2.14 | 2.064 | 9.451 | -2.102 | -9.621 |
| 3.333229805458702 | 2.135 | 2.058 | 9.379 | -2.096 | -9.554 |
| 3.336371398112292 | 2.13 | 2.051 | 9.306 | -2.09 | -9.485 |
| 3.339512990765881 | 2.126 | 2.043 | 9.233 | -2.084 | -9.417 |
| 3.342654583419471 | 2.121 | 2.036 | 9.16 | -2.078 | -9.348 |
| 3.345796176073061 | 2.116 | 2.029 | 9.087 | -2.072 | -9.279 |
| 3.34893776872665 | 2.111 | 2.022 | 9.013 | -2.066 | -9.21 |
| 3.35207936138024 | 2.107 | 2.015 | 8.939 | -2.06 | -9.141 |
| 3.355220954033829 | 2.102 | 2.007 | 8.865 | -2.054 | -9.071 |
| 3.358362546687419 | 2.097 | 2 | 8.791 | -2.048 | -9.002 |
| 3.361504139341009 | 2.092 | 1.992 | 8.717 | -2.041 | -8.932 |
| 3.364645731994598 | 2.087 | 1.985 | 8.643 | -2.035 | -8.862 |
| 3.367787324648188 | 2.082 | 1.977 | 8.568 | -2.029 | -8.792 |
| 3.370928917301777 | 2.077 | 1.969 | 8.494 | -2.022 | -8.722 |
| 3.374070509955367 | 2.072 | 1.962 | 8.42 | -2.016 | -8.652 |
| 3.377212102608956 | 2.067 | 1.954 | 8.345 | -2.01 | -8.582 |
| 3.380353695262546 | 2.062 | 1.946 | 8.271 | -2.003 | -8.512 |
| 3.383495287916136 | 2.056 | 1.938 | 8.197 | -1.996 | -8.443 |
| 3.386636880569725 | 2.051 | 1.93 | 8.122 | -1.99 | -8.373 |
| 3.389778473223315 | 2.046 | 1.923 | 8.048 | -1.983 | -8.303 |
| 3.392920065876904 | 2.041 | 1.915 | 7.974 | -1.977 | -8.233 |
| 3.396061658530494 | 2.036 | 1.907 | 7.901 | -1.97 | -8.163 |
| 3.399203251184084 | 2.03 | 1.899 | 7.827 | -1.963 | -8.094 |
| 3.402344843837673 | 2.025 | 1.891 | 7.753 | -1.957 | -8.024 |
| 3.405486436491263 | 2.02 | 1.882 | 7.68 | -1.95 | -7.955 |
| 3.408628029144852 | 2.015 | 1.874 | 7.607 | -1.943 | -7.886 |
| 3.411769621798442 | 2.009 | 1.866 | 7.534 | -1.936 | -7.817 |
| 3.414911214452032 | 2.004 | 1.858 | 7.461 | -1.93 | -7.749 |
| 3.418052807105621 | 1.999 | 1.85 | 7.389 | -1.923 | -7.68 |
| 3.421194399759211 | 1.993 | 1.841 | 7.316 | -1.916 | -7.612 |
| 3.4243359924128 | 1.988 | 1.833 | 7.244 | -1.909 | -7.544 |
| 3.42747758506639 | 1.983 | 1.825 | 7.173 | -1.902 | -7.476 |
| 3.43061917771998 | 1.977 | 1.817 | 7.102 | -1.895 | -7.409 |
| 3.433760770373569 | 1.972 | 1.808 | 7.03 | -1.888 | -7.342 |
| 3.436902363027159 | 1.966 | 1.8 | 6.96 | -1.881 | -7.275 |
| 3.440043955680748 | 1.961 | 1.791 | 6.889 | -1.874 | -7.208 |
| 3.443185548334338 | 1.956 | 1.783 | 6.819 | -1.867 | -7.142 |
| 3.446327140987927 | 1.95 | 1.775 | 6.75 | -1.86 | -7.076 |
| 3.449468733641517 | 1.945 | 1.766 | 6.681 | -1.853 | -7.01 |
| 3.452610326295107 | 1.939 | 1.758 | 6.612 | -1.846 | -6.945 |
| 3.455751918948696 | 1.934 | 1.749 | 6.543 | -1.839 | -6.88 |
| 3.458893511602286 | 1.929 | 1.741 | 6.475 | -1.832 | -6.815 |
| 3.462035104255876 | 1.923 | 1.732 | 6.408 | -1.825 | -6.751 |
| 3.465176696909465 | 1.918 | 1.724 | 6.34 | -1.818 | -6.687 |
| 3.468318289563055 | 1.912 | 1.715 | 6.274 | -1.811 | -6.624 |
| 3.471459882216644 | 1.907 | 1.707 | 6.207 | -1.804 | -6.561 |
| 3.474601474870234 | 1.902 | 1.698 | 6.141 | -1.797 | -6.498 |
| 3.477743067523824 | 1.896 | 1.69 | 6.076 | -1.79 | -6.436 |
| 3.480884660177413 | 1.891 | 1.681 | 6.011 | -1.783 | -6.374 |
| 3.484026252831002 | 1.885 | 1.673 | 5.946 | -1.776 | -6.313 |
| 3.487167845484592 | 1.88 | 1.664 | 5.882 | -1.769 | -6.252 |
| 3.490309438138182 | 1.875 | 1.656 | 5.818 | -1.762 | -6.191 |
| 3.493451030791772 | 1.869 | 1.647 | 5.755 | -1.755 | -6.131 |
| 3.496592623445361 | 1.864 | 1.639 | 5.692 | -1.748 | -6.071 |
| 3.499734216098951 | 1.858 | 1.63 | 5.63 | -1.741 | -6.012 |
| 3.50287580875254 | 1.853 | 1.622 | 5.568 | -1.733 | -5.953 |
| 3.50601740140613 | 1.848 | 1.613 | 5.507 | -1.726 | -5.894 |
| 3.50915899405972 | 1.842 | 1.605 | 5.446 | -1.719 | -5.836 |
| 3.512300586713309 | 1.837 | 1.596 | 5.386 | -1.712 | -5.779 |
| 3.515442179366899 | 1.832 | 1.587 | 5.326 | -1.705 | -5.722 |
| 3.518583772020488 | 1.826 | 1.579 | 5.267 | -1.698 | -5.665 |
| 3.521725364674078 | 1.821 | 1.57 | 5.208 | -1.691 | -5.609 |
| 3.524866957327668 | 1.816 | 1.562 | 5.15 | -1.684 | -5.553 |
| 3.528008549981257 | 1.811 | 1.553 | 5.092 | -1.677 | -5.498 |
| 3.531150142634847 | 1.805 | 1.545 | 5.035 | -1.67 | -5.443 |
| 3.534291735288436 | 1.8 | 1.536 | 4.978 | -1.663 | -5.389 |
| 3.537433327942026 | 1.795 | 1.528 | 4.922 | -1.656 | -5.335 |
| 3.540574920595616 | 1.79 | 1.52 | 4.866 | -1.649 | -5.281 |
| 3.543716513249205 | 1.784 | 1.511 | 4.811 | -1.642 | -5.228 |
| 3.546858105902795 | 1.779 | 1.503 | 4.756 | -1.635 | -5.176 |
| 3.549999698556384 | 1.774 | 1.494 | 4.702 | -1.628 | -5.124 |
| 3.553141291209974 | 1.769 | 1.486 | 4.649 | -1.621 | -5.072 |
| 3.556282883863564 | 1.764 | 1.477 | 4.595 | -1.614 | -5.021 |
| 3.559424476517153 | 1.759 | 1.469 | 4.543 | -1.607 | -4.97 |
| 3.562566069170743 | 1.753 | 1.461 | 4.49 | -1.6 | -4.92 |
| 3.565707661824332 | 1.748 | 1.452 | 4.439 | -1.593 | -4.87 |
| 3.568849254477922 | 1.743 | 1.444 | 4.388 | -1.586 | -4.821 |
| 3.571990847131511 | 1.738 | 1.436 | 4.337 | -1.58 | -4.772 |
| 3.575132439785101 | 1.733 | 1.427 | 4.287 | -1.573 | -4.724 |
| 3.578274032438691 | 1.728 | 1.419 | 4.237 | -1.566 | -4.676 |
| 3.58141562509228 | 1.723 | 1.411 | 4.188 | -1.559 | -4.628 |
| 3.58455721774587 | 1.718 | 1.402 | 4.139 | -1.552 | -4.581 |
| 3.58769881039946 | 1.713 | 1.394 | 4.091 | -1.545 | -4.535 |
| 3.590840403053049 | 1.708 | 1.386 | 4.043 | -1.539 | -4.489 |
| 3.593981995706639 | 1.703 | 1.378 | 3.996 | -1.532 | -4.443 |
| 3.597123588360228 | 1.698 | 1.369 | 3.949 | -1.525 | -4.398 |
| 3.600265181013818 | 1.693 | 1.361 | 3.903 | -1.518 | -4.353 |
| 3.603406773667407 | 1.688 | 1.353 | 3.857 | -1.511 | -4.309 |
| 3.606548366320997 | 1.683 | 1.345 | 3.812 | -1.505 | -4.265 |
| 3.609689958974587 | 1.679 | 1.337 | 3.767 | -1.498 | -4.221 |
| 3.612831551628176 | 1.674 | 1.329 | 3.723 | -1.491 | -4.178 |
| 3.615973144281766 | 1.669 | 1.321 | 3.679 | -1.485 | -4.135 |
| 3.619114736935355 | 1.664 | 1.313 | 3.635 | -1.478 | -4.093 |
| 3.622256329588945 | 1.659 | 1.305 | 3.592 | -1.471 | -4.051 |
| 3.625397922242534 | 1.655 | 1.297 | 3.55 | -1.465 | -4.01 |
| 3.628539514896124 | 1.65 | 1.289 | 3.508 | -1.458 | -3.969 |
| 3.631681107549714 | 1.645 | 1.281 | 3.466 | -1.452 | -3.929 |
| 3.634822700203303 | 1.64 | 1.273 | 3.425 | -1.445 | -3.889 |
| 3.637964292856893 | 1.636 | 1.265 | 3.384 | -1.438 | -3.849 |
| 3.641105885510483 | 1.631 | 1.257 | 3.344 | -1.432 | -3.81 |
| 3.644247478164072 | 1.627 | 1.249 | 3.304 | -1.425 | -3.771 |
| 3.647389070817662 | 1.622 | 1.241 | 3.265 | -1.419 | -3.732 |
| 3.650530663471251 | 1.617 | 1.233 | 3.226 | -1.412 | -3.694 |
| 3.653672256124841 | 1.613 | 1.226 | 3.188 | -1.406 | -3.657 |
| 3.656813848778431 | 1.608 | 1.218 | 3.149 | -1.399 | -3.619 |
| 3.65995544143202 | 1.604 | 1.21 | 3.112 | -1.393 | -3.582 |
| 3.66309703408561 | 1.599 | 1.202 | 3.075 | -1.387 | -3.546 |
| 3.666238626739199 | 1.595 | 1.195 | 3.038 | -1.38 | -3.51 |
| 3.66938021939279 | 1.59 | 1.187 | 3.001 | -1.374 | -3.474 |
| 3.672521812046378 | 1.586 | 1.179 | 2.965 | -1.367 | -3.439 |
| 3.675663404699968 | 1.581 | 1.172 | 2.93 | -1.361 | -3.404 |
| 3.678804997353558 | 1.577 | 1.164 | 2.895 | -1.355 | -3.369 |
| 3.681946590007147 | 1.573 | 1.156 | 2.86 | -1.349 | -3.335 |
| 3.685088182660737 | 1.568 | 1.149 | 2.825 | -1.342 | -3.301 |
| 3.688229775314326 | 1.564 | 1.141 | 2.791 | -1.336 | -3.268 |
| 3.691371367967916 | 1.56 | 1.134 | 2.758 | -1.33 | -3.234 |
| 3.694512960621506 | 1.555 | 1.126 | 2.725 | -1.324 | -3.202 |
| 3.697654553275095 | 1.551 | 1.119 | 2.692 | -1.317 | -3.169 |
| 3.700796145928685 | 1.547 | 1.111 | 2.659 | -1.311 | -3.137 |
| 3.703937738582274 | 1.543 | 1.104 | 2.627 | -1.305 | -3.105 |
| 3.707079331235864 | 1.538 | 1.097 | 2.595 | -1.299 | -3.074 |
| 3.710220923889454 | 1.534 | 1.089 | 2.564 | -1.293 | -3.043 |
| 3.713362516543043 | 1.53 | 1.082 | 2.533 | -1.287 | -3.012 |
| 3.716504109196633 | 1.526 | 1.075 | 2.502 | -1.281 | -2.982 |
| 3.719645701850223 | 1.522 | 1.067 | 2.472 | -1.275 | -2.951 |
| 3.722787294503812 | 1.518 | 1.06 | 2.442 | -1.268 | -2.922 |
| 3.725928887157402 | 1.514 | 1.053 | 2.412 | -1.262 | -2.892 |
| 3.729070479810991 | 1.51 | 1.046 | 2.383 | -1.256 | -2.863 |
| 3.732212072464581 | 1.506 | 1.039 | 2.354 | -1.25 | -2.834 |
| 3.735353665118171 | 1.502 | 1.032 | 2.326 | -1.245 | -2.806 |
| 3.73849525777176 | 1.498 | 1.024 | 2.297 | -1.239 | -2.778 |
| 3.74163685042535 | 1.494 | 1.017 | 2.269 | -1.233 | -2.75 |
| 3.744778443078939 | 1.49 | 1.01 | 2.242 | -1.227 | -2.722 |
| 3.747920035732529 | 1.486 | 1.003 | 2.215 | -1.221 | -2.695 |
| 3.751061628386119 | 1.482 | 0.996 | 2.188 | -1.215 | -2.668 |
| 3.754203221039708 | 1.478 | 0.989 | 2.161 | -1.209 | -2.641 |
| 3.757344813693298 | 1.474 | 0.982 | 2.135 | -1.203 | -2.615 |
| 3.760486406346887 | 1.47 | 0.975 | 2.109 | -1.198 | -2.589 |
| 3.763627999000477 | 1.466 | 0.969 | 2.083 | -1.192 | -2.563 |
| 3.766769591654067 | 1.463 | 0.962 | 2.057 | -1.186 | -2.537 |
| 3.769911184307656 | 1.459 | 0.955 | 2.032 | -1.18 | -2.512 |
| 3.773052776961246 | 1.455 | 0.948 | 2.007 | -1.175 | -2.487 |
| 3.776194369614835 | 1.451 | 0.941 | 1.983 | -1.169 | -2.462 |
| 3.779335962268425 | 1.448 | 0.935 | 1.959 | -1.163 | -2.438 |
| 3.782477554922014 | 1.444 | 0.928 | 1.935 | -1.157 | -2.414 |
| 3.785619147575604 | 1.44 | 0.921 | 1.911 | -1.152 | -2.39 |
| 3.788760740229193 | 1.437 | 0.914 | 1.888 | -1.146 | -2.366 |
| 3.791902332882783 | 1.433 | 0.908 | 1.864 | -1.141 | -2.343 |
| 3.795043925536373 | 1.43 | 0.901 | 1.842 | -1.135 | -2.319 |
| 3.798185518189962 | 1.426 | 0.895 | 1.819 | -1.129 | -2.296 |
| 3.801327110843552 | 1.422 | 0.888 | 1.797 | -1.124 | -2.274 |
| 3.804468703497142 | 1.419 | 0.882 | 1.775 | -1.118 | -2.251 |
| 3.807610296150731 | 1.415 | 0.875 | 1.753 | -1.113 | -2.229 |
| 3.810751888804321 | 1.412 | 0.869 | 1.731 | -1.107 | -2.207 |
| 3.813893481457911 | 1.408 | 0.862 | 1.71 | -1.102 | -2.186 |
| 3.8170350741115 | 1.405 | 0.856 | 1.689 | -1.096 | -2.164 |
| 3.82017666676509 | 1.401 | 0.849 | 1.668 | -1.091 | -2.143 |
| 3.823318259418679 | 1.398 | 0.843 | 1.648 | -1.086 | -2.122 |
| 3.826459852072269 | 1.395 | 0.837 | 1.627 | -1.08 | -2.101 |
| 3.829601444725859 | 1.391 | 0.83 | 1.607 | -1.075 | -2.08 |
| 3.832743037379448 | 1.388 | 0.824 | 1.587 | -1.069 | -2.06 |
| 3.835884630033038 | 1.385 | 0.818 | 1.568 | -1.064 | -2.04 |
| 3.839026222686627 | 1.381 | 0.812 | 1.548 | -1.059 | -2.02 |
| 3.842167815340217 | 1.378 | 0.805 | 1.529 | -1.053 | -2 |
| 3.845309407993807 | 1.375 | 0.799 | 1.51 | -1.048 | -1.981 |
| 3.848451000647396 | 1.371 | 0.793 | 1.492 | -1.043 | -1.962 |
| 3.851592593300986 | 1.368 | 0.787 | 1.473 | -1.038 | -1.943 |
| 3.854734185954575 | 1.365 | 0.781 | 1.455 | -1.032 | -1.924 |
| 3.857875778608165 | 1.362 | 0.775 | 1.437 | -1.027 | -1.905 |
| 3.861017371261755 | 1.359 | 0.769 | 1.419 | -1.022 | -1.887 |
| 3.864158963915344 | 1.356 | 0.763 | 1.401 | -1.017 | -1.868 |
| 3.867300556568933 | 1.352 | 0.757 | 1.384 | -1.012 | -1.85 |
| 3.870442149222523 | 1.349 | 0.751 | 1.367 | -1.006 | -1.832 |
| 3.873583741876112 | 1.346 | 0.745 | 1.35 | -1.001 | -1.815 |
| 3.876725334529703 | 1.343 | 0.739 | 1.333 | -0.996 | -1.797 |
| 3.879866927183292 | 1.34 | 0.733 | 1.316 | -0.991 | -1.78 |
| 3.883008519836882 | 1.337 | 0.727 | 1.3 | -0.986 | -1.763 |
| 3.886150112490471 | 1.334 | 0.721 | 1.284 | -0.981 | -1.746 |
| 3.889291705144061 | 1.331 | 0.716 | 1.268 | -0.976 | -1.729 |
| 3.892433297797651 | 1.328 | 0.71 | 1.252 | -0.971 | -1.712 |
| 3.89557489045124 | 1.325 | 0.704 | 1.236 | -0.966 | -1.696 |
| 3.89871648310483 | 1.322 | 0.698 | 1.221 | -0.961 | -1.68 |
| 3.901858075758419 | 1.319 | 0.693 | 1.205 | -0.956 | -1.664 |
| 3.904999668412009 | 1.316 | 0.687 | 1.19 | -0.951 | -1.648 |
| 3.908141261065598 | 1.313 | 0.681 | 1.175 | -0.946 | -1.632 |
| 3.911282853719188 | 1.31 | 0.676 | 1.161 | -0.941 | -1.616 |
| 3.914424446372778 | 1.308 | 0.67 | 1.146 | -0.936 | -1.601 |
| 3.917566039026367 | 1.305 | 0.665 | 1.132 | -0.931 | -1.586 |
| 3.920707631679957 | 1.302 | 0.659 | 1.117 | -0.926 | -1.57 |
| 3.923849224333547 | 1.299 | 0.654 | 1.103 | -0.922 | -1.555 |
| 3.926990816987136 | 1.296 | 0.648 | 1.089 | -0.917 | -1.541 |
| 3.930132409640726 | 1.294 | 0.643 | 1.076 | -0.912 | -1.526 |
| 3.933274002294315 | 1.291 | 0.637 | 1.062 | -0.907 | -1.512 |
| 3.936415594947905 | 1.288 | 0.632 | 1.049 | -0.902 | -1.497 |
| 3.939557187601495 | 1.285 | 0.627 | 1.035 | -0.897 | -1.483 |
| 3.942698780255084 | 1.283 | 0.621 | 1.022 | -0.893 | -1.469 |
| 3.945840372908674 | 1.28 | 0.616 | 1.009 | -0.888 | -1.455 |
| 3.948981965562263 | 1.277 | 0.611 | 0.996 | -0.883 | -1.441 |
| 3.952123558215853 | 1.275 | 0.605 | 0.984 | -0.878 | -1.428 |
| 3.955265150869442 | 1.272 | 0.6 | 0.971 | -0.874 | -1.414 |
| 3.958406743523032 | 1.27 | 0.595 | 0.959 | -0.869 | -1.401 |
| 3.961548336176622 | 1.267 | 0.59 | 0.947 | -0.864 | -1.388 |
| 3.964689928830211 | 1.264 | 0.585 | 0.935 | -0.86 | -1.374 |
| 3.967831521483801 | 1.262 | 0.579 | 0.923 | -0.855 | -1.362 |
| 3.97097311413739 | 1.259 | 0.574 | 0.911 | -0.85 | -1.349 |
| 3.97411470679098 | 1.257 | 0.569 | 0.899 | -0.846 | -1.336 |
| 3.97725629944457 | 1.254 | 0.564 | 0.888 | -0.841 | -1.323 |
| 3.98039789209816 | 1.252 | 0.559 | 0.876 | -0.837 | -1.311 |
| 3.983539484751749 | 1.249 | 0.554 | 0.865 | -0.832 | -1.299 |
| 3.986681077405338 | 1.247 | 0.549 | 0.854 | -0.827 | -1.286 |
| 3.989822670058928 | 1.244 | 0.544 | 0.843 | -0.823 | -1.274 |
| 3.992964262712517 | 1.242 | 0.539 | 0.832 | -0.818 | -1.262 |
| 3.996105855366107 | 1.24 | 0.534 | 0.821 | -0.814 | -1.251 |
| 3.999247448019697 | 1.237 | 0.53 | 0.81 | -0.809 | -1.239 |
| 4.002389040673287 | 1.235 | 0.525 | 0.8 | -0.805 | -1.227 |
| 4.005530633326877 | 1.232 | 0.52 | 0.79 | -0.8 | -1.216 |
| 4.008672225980466 | 1.23 | 0.515 | 0.779 | -0.796 | -1.204 |
| 4.011813818634056 | 1.228 | 0.51 | 0.769 | -0.791 | -1.193 |
| 4.014955411287645 | 1.225 | 0.505 | 0.759 | -0.787 | -1.182 |
| 4.018097003941234 | 1.223 | 0.501 | 0.749 | -0.783 | -1.171 |
| 4.021238596594824 | 1.221 | 0.496 | 0.739 | -0.778 | -1.16 |
| 4.024380189248414 | 1.219 | 0.491 | 0.73 | -0.774 | -1.149 |
| 4.027521781902004 | 1.216 | 0.487 | 0.72 | -0.769 | -1.138 |
| 4.030663374555593 | 1.214 | 0.482 | 0.711 | -0.765 | -1.128 |
| 4.033804967209183 | 1.212 | 0.477 | 0.701 | -0.761 | -1.117 |
| 4.036946559862773 | 1.21 | 0.473 | 0.692 | -0.756 | -1.107 |
| 4.040088152516362 | 1.208 | 0.468 | 0.683 | -0.752 | -1.097 |
| 4.043229745169951 | 1.205 | 0.464 | 0.674 | -0.748 | -1.086 |
| 4.046371337823541 | 1.203 | 0.459 | 0.665 | -0.743 | -1.076 |
| 4.049512930477131 | 1.201 | 0.455 | 0.656 | -0.739 | -1.066 |
| 4.05265452313072 | 1.199 | 0.45 | 0.647 | -0.735 | -1.056 |
| 4.05579611578431 | 1.197 | 0.446 | 0.639 | -0.731 | -1.046 |
| 4.0589377084379 | 1.195 | 0.442 | 0.63 | -0.726 | -1.037 |
| 4.062079301091489 | 1.193 | 0.437 | 0.622 | -0.722 | -1.027 |
| 4.065220893745079 | 1.191 | 0.433 | 0.613 | -0.718 | -1.017 |
| 4.068362486398668 | 1.188 | 0.428 | 0.605 | -0.714 | -1.008 |
| 4.071504079052258 | 1.186 | 0.424 | 0.597 | -0.709 | -0.998 |
| 4.074645671705848 | 1.184 | 0.42 | 0.589 | -0.705 | -0.989 |
| 4.077787264359437 | 1.182 | 0.416 | 0.581 | -0.701 | -0.98 |
| 4.080928857013027 | 1.18 | 0.411 | 0.573 | -0.697 | -0.971 |
| 4.084070449666616 | 1.178 | 0.407 | 0.565 | -0.693 | -0.962 |
| 4.087212042320206 | 1.176 | 0.403 | 0.558 | -0.688 | -0.953 |
| 4.090353634973795 | 1.174 | 0.399 | 0.55 | -0.684 | -0.944 |
| 4.093495227627385 | 1.173 | 0.395 | 0.543 | -0.68 | -0.935 |
| 4.096636820280975 | 1.171 | 0.39 | 0.535 | -0.676 | -0.926 |
| 4.099778412934564 | 1.169 | 0.386 | 0.528 | -0.672 | -0.918 |
| 4.102920005588154 | 1.167 | 0.382 | 0.52 | -0.668 | -0.909 |
| 4.106061598241744 | 1.165 | 0.378 | 0.513 | -0.664 | -0.901 |
| 4.109203190895333 | 1.163 | 0.374 | 0.506 | -0.66 | -0.892 |
| 4.112344783548923 | 1.161 | 0.37 | 0.499 | -0.656 | -0.884 |
| 4.115486376202512 | 1.159 | 0.366 | 0.492 | -0.652 | -0.876 |
| 4.118627968856102 | 1.157 | 0.362 | 0.485 | -0.648 | -0.868 |
| 4.121769561509692 | 1.156 | 0.358 | 0.479 | -0.644 | -0.859 |
| 4.124911154163281 | 1.154 | 0.354 | 0.472 | -0.64 | -0.851 |
| 4.128052746816871 | 1.152 | 0.351 | 0.465 | -0.636 | -0.843 |
| 4.13119433947046 | 1.15 | 0.347 | 0.459 | -0.632 | -0.835 |
| 4.13433593212405 | 1.148 | 0.343 | 0.452 | -0.628 | -0.828 |
| 4.13747752477764 | 1.147 | 0.339 | 0.446 | -0.624 | -0.82 |
| 4.14061911743123 | 1.145 | 0.335 | 0.439 | -0.62 | -0.812 |
| 4.143760710084818 | 1.143 | 0.331 | 0.433 | -0.616 | -0.805 |
| 4.146902302738408 | 1.142 | 0.328 | 0.427 | -0.612 | -0.797 |
| 4.150043895391998 | 1.14 | 0.324 | 0.421 | -0.608 | -0.789 |
| 4.153185488045588 | 1.138 | 0.32 | 0.415 | -0.604 | -0.782 |
| 4.156327080699177 | 1.136 | 0.317 | 0.409 | -0.6 | -0.775 |
| 4.159468673352766 | 1.135 | 0.313 | 0.403 | -0.596 | -0.767 |
| 4.162610266006356 | 1.133 | 0.309 | 0.397 | -0.592 | -0.76 |
| 4.165751858659946 | 1.131 | 0.306 | 0.391 | -0.588 | -0.753 |
| 4.168893451313535 | 1.13 | 0.302 | 0.386 | -0.584 | -0.746 |
| 4.172035043967125 | 1.128 | 0.299 | 0.38 | -0.58 | -0.739 |
| 4.175176636620715 | 1.127 | 0.295 | 0.374 | -0.577 | -0.732 |
| 4.178318229274304 | 1.125 | 0.292 | 0.369 | -0.573 | -0.725 |
| 4.181459821927894 | 1.123 | 0.288 | 0.364 | -0.569 | -0.718 |
| 4.184601414581484 | 1.122 | 0.285 | 0.358 | -0.565 | -0.711 |
| 4.187743007235073 | 1.12 | 0.281 | 0.353 | -0.561 | -0.704 |
| 4.190884599888663 | 1.119 | 0.278 | 0.348 | -0.557 | -0.698 |
| 4.194026192542252 | 1.117 | 0.274 | 0.342 | -0.554 | -0.691 |
| 4.197167785195842 | 1.116 | 0.271 | 0.337 | -0.55 | -0.684 |
| 4.200309377849432 | 1.114 | 0.268 | 0.332 | -0.546 | -0.678 |
| 4.203450970503021 | 1.113 | 0.264 | 0.327 | -0.542 | -0.671 |
| 4.206592563156611 | 1.111 | 0.261 | 0.322 | -0.538 | -0.665 |
| 4.2097341558102 | 1.11 | 0.258 | 0.317 | -0.535 | -0.658 |
| 4.21287574846379 | 1.108 | 0.254 | 0.312 | -0.531 | -0.652 |
| 4.21601734111738 | 1.107 | 0.251 | 0.308 | -0.527 | -0.646 |
| 4.21915893377097 | 1.105 | 0.248 | 0.303 | -0.523 | -0.639 |
| 4.222300526424559 | 1.104 | 0.245 | 0.298 | -0.52 | -0.633 |
| 4.225442119078148 | 1.103 | 0.241 | 0.293 | -0.516 | -0.627 |
| 4.228583711731738 | 1.101 | 0.238 | 0.289 | -0.512 | -0.621 |
| 4.231725304385327 | 1.1 | 0.235 | 0.284 | -0.508 | -0.615 |
| 4.234866897038917 | 1.098 | 0.232 | 0.28 | -0.505 | -0.609 |
| 4.238008489692506 | 1.097 | 0.229 | 0.275 | -0.501 | -0.603 |
| 4.241150082346096 | 1.096 | 0.226 | 0.271 | -0.497 | -0.597 |
| 4.244291674999685 | 1.094 | 0.223 | 0.267 | -0.494 | -0.591 |
| 4.247433267653276 | 1.093 | 0.22 | 0.262 | -0.49 | -0.585 |
| 4.250574860306865 | 1.092 | 0.217 | 0.258 | -0.486 | -0.58 |
| 4.253716452960455 | 1.09 | 0.214 | 0.254 | -0.483 | -0.574 |
| 4.256858045614044 | 1.089 | 0.211 | 0.25 | -0.479 | -0.568 |
| 4.259999638267634 | 1.088 | 0.208 | 0.246 | -0.475 | -0.563 |
| 4.263141230921224 | 1.086 | 0.205 | 0.242 | -0.472 | -0.557 |
| 4.266282823574813 | 1.085 | 0.202 | 0.238 | -0.468 | -0.551 |
| 4.269424416228403 | 1.084 | 0.199 | 0.234 | -0.465 | -0.546 |
| 4.272566008881992 | 1.083 | 0.196 | 0.23 | -0.461 | -0.54 |
| 4.275707601535582 | 1.081 | 0.193 | 0.226 | -0.457 | -0.535 |
| 4.27884919418917 | 1.08 | 0.191 | 0.222 | -0.454 | -0.529 |
| 4.28199078684276 | 1.079 | 0.188 | 0.219 | -0.45 | -0.524 |
| 4.285132379496351 | 1.078 | 0.185 | 0.215 | -0.447 | -0.519 |
| 4.28827397214994 | 1.077 | 0.182 | 0.211 | -0.443 | -0.513 |
| 4.29141556480353 | 1.075 | 0.18 | 0.208 | -0.439 | -0.508 |
| 4.294557157457119 | 1.074 | 0.177 | 0.204 | -0.436 | -0.503 |
| 4.29769875011071 | 1.073 | 0.174 | 0.201 | -0.432 | -0.498 |
| 4.300840342764299 | 1.072 | 0.172 | 0.197 | -0.429 | -0.493 |
| 4.303981935417888 | 1.071 | 0.169 | 0.194 | -0.425 | -0.488 |
| 4.307123528071478 | 1.07 | 0.166 | 0.19 | -0.422 | -0.482 |
| 4.310265120725067 | 1.068 | 0.164 | 0.187 | -0.418 | -0.477 |
| 4.313406713378657 | 1.067 | 0.161 | 0.184 | -0.415 | -0.472 |
| 4.316548306032247 | 1.066 | 0.159 | 0.18 | -0.411 | -0.467 |
| 4.319689898685836 | 1.065 | 0.156 | 0.177 | -0.408 | -0.462 |
| 4.322831491339426 | 1.064 | 0.153 | 0.174 | -0.404 | -0.458 |
| 4.325973083993015 | 1.063 | 0.151 | 0.171 | -0.401 | -0.453 |
| 4.329114676646605 | 1.062 | 0.149 | 0.167 | -0.397 | -0.448 |
| 4.332256269300195 | 1.061 | 0.146 | 0.164 | -0.394 | -0.443 |
| 4.335397861953784 | 1.06 | 0.144 | 0.161 | -0.39 | -0.438 |
| 4.338539454607374 | 1.059 | 0.141 | 0.158 | -0.387 | -0.434 |
| 4.341681047260963 | 1.058 | 0.139 | 0.155 | -0.383 | -0.429 |
| 4.344822639914553 | 1.057 | 0.136 | 0.152 | -0.38 | -0.424 |
| 4.347964232568143 | 1.056 | 0.134 | 0.149 | -0.376 | -0.419 |
| 4.351105825221732 | 1.055 | 0.132 | 0.147 | -0.373 | -0.415 |
| 4.354247417875322 | 1.054 | 0.129 | 0.144 | -0.369 | -0.41 |
| 4.357389010528911 | 1.053 | 0.127 | 0.141 | -0.366 | -0.406 |
| 4.360530603182501 | 1.052 | 0.125 | 0.138 | -0.363 | -0.401 |
| 4.36367219583609 | 1.051 | 0.123 | 0.136 | -0.359 | -0.397 |
| 4.36681378848968 | 1.05 | 0.12 | 0.133 | -0.356 | -0.392 |
| 4.36995538114327 | 1.049 | 0.118 | 0.13 | -0.352 | -0.388 |
| 4.373096973796859 | 1.048 | 0.116 | 0.128 | -0.349 | -0.383 |
| 4.376238566450449 | 1.047 | 0.114 | 0.125 | -0.345 | -0.379 |
| 4.379380159104038 | 1.046 | 0.112 | 0.122 | -0.342 | -0.374 |
| 4.382521751757628 | 1.045 | 0.11 | 0.12 | -0.339 | -0.37 |
| 4.385663344411217 | 1.045 | 0.108 | 0.117 | -0.335 | -0.366 |
| 4.388804937064807 | 1.044 | 0.106 | 0.115 | -0.332 | -0.361 |
| 4.391946529718397 | 1.043 | 0.103 | 0.113 | -0.328 | -0.357 |
| 4.395088122371987 | 1.042 | 0.101 | 0.11 | -0.325 | -0.353 |
| 4.398229715025576 | 1.041 | 0.099 | 0.108 | -0.322 | -0.349 |
| 4.401371307679165 | 1.04 | 0.097 | 0.105 | -0.318 | -0.344 |
| 4.404512900332755 | 1.039 | 0.095 | 0.103 | -0.315 | -0.34 |
| 4.407654492986345 | 1.039 | 0.093 | 0.101 | -0.312 | -0.336 |
| 4.410796085639934 | 1.038 | 0.092 | 0.099 | -0.308 | -0.332 |
| 4.413937678293524 | 1.037 | 0.09 | 0.096 | -0.305 | -0.328 |
| 4.417079270947114 | 1.036 | 0.088 | 0.094 | -0.302 | -0.324 |
| 4.420220863600703 | 1.035 | 0.086 | 0.092 | -0.298 | -0.32 |
| 4.423362456254293 | 1.035 | 0.084 | 0.09 | -0.295 | -0.316 |
| 4.426504048907883 | 1.034 | 0.082 | 0.088 | -0.292 | -0.312 |
| 4.429645641561472 | 1.033 | 0.08 | 0.086 | -0.288 | -0.308 |
| 4.432787234215062 | 1.032 | 0.079 | 0.084 | -0.285 | -0.304 |
| 4.435928826868651 | 1.032 | 0.077 | 0.082 | -0.282 | -0.3 |
| 4.43907041952224 | 1.031 | 0.075 | 0.08 | -0.278 | -0.296 |
| 4.44221201217583 | 1.03 | 0.073 | 0.078 | -0.275 | -0.292 |
| 4.44535360482942 | 1.029 | 0.072 | 0.076 | -0.272 | -0.288 |
| 4.44849519748301 | 1.029 | 0.07 | 0.074 | -0.268 | -0.284 |
| 4.4516367901366 | 1.028 | 0.068 | 0.072 | -0.265 | -0.28 |
| 4.454778382790188 | 1.027 | 0.067 | 0.07 | -0.262 | -0.276 |
| 4.457919975443779 | 1.027 | 0.065 | 0.069 | -0.258 | -0.272 |
| 4.461061568097368 | 1.026 | 0.063 | 0.067 | -0.255 | -0.269 |
| 4.464203160750958 | 1.025 | 0.062 | 0.065 | -0.252 | -0.265 |
| 4.467344753404547 | 1.025 | 0.06 | 0.063 | -0.249 | -0.261 |
| 4.470486346058137 | 1.024 | 0.059 | 0.062 | -0.245 | -0.257 |
| 4.473627938711726 | 1.023 | 0.057 | 0.06 | -0.242 | -0.254 |
| 4.476769531365316 | 1.023 | 0.056 | 0.058 | -0.239 | -0.25 |
| 4.479911124018905 | 1.022 | 0.054 | 0.057 | -0.236 | -0.246 |
| 4.483052716672495 | 1.022 | 0.053 | 0.055 | -0.232 | -0.242 |
| 4.486194309326085 | 1.021 | 0.051 | 0.054 | -0.229 | -0.239 |
| 4.489335901979674 | 1.02 | 0.05 | 0.052 | -0.226 | -0.235 |
| 4.492477494633264 | 1.02 | 0.049 | 0.05 | -0.222 | -0.231 |
| 4.495619087286854 | 1.019 | 0.047 | 0.049 | -0.219 | -0.228 |
| 4.498760679940443 | 1.019 | 0.046 | 0.048 | -0.216 | -0.224 |
| 4.501902272594033 | 1.018 | 0.044 | 0.046 | -0.213 | -0.221 |
| 4.505043865247622 | 1.018 | 0.043 | 0.045 | -0.209 | -0.217 |
| 4.508185457901212 | 1.017 | 0.042 | 0.043 | -0.206 | -0.213 |
| 4.511327050554801 | 1.017 | 0.041 | 0.042 | -0.203 | -0.21 |
| 4.514468643208391 | 1.016 | 0.039 | 0.041 | -0.2 | -0.206 |
| 4.517610235861981 | 1.016 | 0.038 | 0.039 | -0.197 | -0.203 |
| 4.520751828515571 | 1.015 | 0.037 | 0.038 | -0.193 | -0.199 |
| 4.52389342116916 | 1.015 | 0.036 | 0.037 | -0.19 | -0.196 |
| 4.52703501382275 | 1.014 | 0.034 | 0.035 | -0.187 | -0.192 |
| 4.530176606476339 | 1.014 | 0.033 | 0.034 | -0.184 | -0.189 |
| 4.533318199129928 | 1.013 | 0.032 | 0.033 | -0.18 | -0.185 |
| 4.536459791783518 | 1.013 | 0.031 | 0.032 | -0.177 | -0.182 |
| 4.539601384437108 | 1.012 | 0.03 | 0.031 | -0.174 | -0.178 |
| 4.542742977090698 | 1.012 | 0.029 | 0.03 | -0.171 | -0.175 |
| 4.545884569744287 | 1.011 | 0.028 | 0.028 | -0.168 | -0.171 |
| 4.549026162397876 | 1.011 | 0.027 | 0.027 | -0.164 | -0.168 |
| 4.552167755051466 | 1.01 | 0.026 | 0.026 | -0.161 | -0.165 |
| 4.555309347705056 | 1.01 | 0.025 | 0.025 | -0.158 | -0.161 |
| 4.558450940358646 | 1.01 | 0.024 | 0.024 | -0.155 | -0.158 |
| 4.561592533012235 | 1.009 | 0.023 | 0.023 | -0.152 | -0.154 |
| 4.564734125665825 | 1.009 | 0.022 | 0.022 | -0.148 | -0.151 |
| 4.567875718319415 | 1.009 | 0.021 | 0.021 | -0.145 | -0.148 |
| 4.571017310973004 | 1.008 | 0.02 | 0.02 | -0.142 | -0.144 |
| 4.574158903626594 | 1.008 | 0.019 | 0.019 | -0.139 | -0.141 |
| 4.577300496280183 | 1.007 | 0.018 | 0.019 | -0.136 | -0.138 |
| 4.580442088933772 | 1.007 | 0.017 | 0.018 | -0.132 | -0.134 |
| 4.583583681587362 | 1.007 | 0.017 | 0.017 | -0.129 | -0.131 |
| 4.586725274240952 | 1.006 | 0.016 | 0.016 | -0.126 | -0.128 |
| 4.589866866894542 | 1.006 | 0.015 | 0.015 | -0.123 | -0.124 |
| 4.593008459548131 | 1.006 | 0.014 | 0.014 | -0.12 | -0.121 |
| 4.596150052201721 | 1.005 | 0.014 | 0.014 | -0.117 | -0.118 |
| 4.59929164485531 | 1.005 | 0.013 | 0.013 | -0.113 | -0.115 |
| 4.6024332375089 | 1.005 | 0.012 | 0.012 | -0.11 | -0.111 |
| 4.60557483016249 | 1.005 | 0.011 | 0.012 | -0.107 | -0.108 |
| 4.608716422816079 | 1.004 | 0.011 | 0.011 | -0.104 | -0.105 |
| 4.611858015469668 | 1.004 | 0.01 | 0.01 | -0.101 | -0.102 |
| 4.614999608123258 | 1.004 | 0.009 | 0.01 | -0.098 | -0.098 |
| 4.618141200776848 | 1.004 | 0.009 | 0.009 | -0.094 | -0.095 |
| 4.621282793430437 | 1.003 | 0.008 | 0.008 | -0.091 | -0.092 |
| 4.624424386084027 | 1.003 | 0.008 | 0.008 | -0.088 | -0.089 |
| 4.627565978737617 | 1.003 | 0.007 | 0.007 | -0.085 | -0.085 |
| 4.630707571391206 | 1.003 | 0.007 | 0.007 | -0.082 | -0.082 |
| 4.633849164044795 | 1.003 | 0.006 | 0.006 | -0.079 | -0.079 |
| 4.636990756698386 | 1.002 | 0.006 | 0.006 | -0.076 | -0.076 |
| 4.640132349351975 | 1.002 | 0.005 | 0.005 | -0.072 | -0.073 |
| 4.643273942005564 | 1.002 | 0.005 | 0.005 | -0.069 | -0.069 |
| 4.646415534659154 | 1.002 | 0.004 | 0.004 | -0.066 | -0.066 |
| 4.649557127312744 | 1.002 | 0.004 | 0.004 | -0.063 | -0.063 |
| 4.652698719966334 | 1.001 | 0.004 | 0.004 | -0.06 | -0.06 |
| 4.655840312619923 | 1.001 | 0.003 | 0.003 | -0.057 | -0.057 |
| 4.658981905273513 | 1.001 | 0.003 | 0.003 | -0.053 | -0.054 |
| 4.662123497927102 | 1.001 | 0.003 | 0.003 | -0.05 | -0.05 |
| 4.665265090580692 | 1.001 | 0.002 | 0.002 | -0.047 | -0.047 |
| 4.668406683234282 | 1.001 | 0.002 | 0.002 | -0.044 | -0.044 |
| 4.671548275887871 | 1.001 | 0.002 | 0.002 | -0.041 | -0.041 |
| 4.674689868541461 | 1.001 | 0.001 | 0.001 | -0.038 | -0.038 |
| 4.67783146119505 | 1 | 0.001 | 0.001 | -0.035 | -0.035 |
| 4.68097305384864 | 1 | 0.001 | 0.001 | -0.031 | -0.031 |
| 4.68411464650223 | 1 | 0.001 | 0.001 | -0.028 | -0.028 |
| 4.687256239155819 | 1 | 0.001 | 0.001 | -0.025 | -0.025 |
| 4.690397831809409 | 1 | 0 | 0 | -0.022 | -0.022 |
| 4.693539424462998 | 1 | 0 | 0 | -0.019 | -0.019 |
| 4.696681017116588 | 1 | 0 | 0 | -0.016 | -0.016 |
| 4.699822609770177 | 1 | 0 | 0 | -0.013 | -0.013 |
| 4.702964202423767 | 1 | 0 | 0 | -0.009 | -0.009 |
| 4.706105795077356 | 1 | 0 | 0 | -0.006 | -0.006 |
| 4.709247387730946 | 1 | 0 | 0 | -0.003 | -0.003 |
| 4.712388980384535 | 1 | 0 | 0 | 0 | 0 |
| 4.715530573038126 | 1 | 0 | 0 | 0.003 | 0.003 |
| 4.718672165691715 | 1 | 0 | 0 | 0.006 | 0.006 |
| 4.721813758345305 | 1 | 0 | 0 | 0.009 | 0.009 |
| 4.724955350998894 | 1 | 0 | 0 | 0.013 | 0.013 |
| 4.728096943652484 | 1 | 0 | 0 | 0.016 | 0.016 |
| 4.731238536306074 | 1 | 0 | 0 | 0.019 | 0.019 |
| 4.734380128959663 | 1 | 0 | 0 | 0.022 | 0.022 |
| 4.737521721613253 | 1 | 0.001 | 0.001 | 0.025 | 0.025 |
| 4.740663314266842 | 1 | 0.001 | 0.001 | 0.028 | 0.028 |
| 4.743804906920432 | 1 | 0.001 | 0.001 | 0.031 | 0.031 |
| 4.74694649957402 | 1 | 0.001 | 0.001 | 0.035 | 0.035 |
| 4.750088092227611 | 1.001 | 0.001 | 0.001 | 0.038 | 0.038 |
| 4.7532296848812 | 1.001 | 0.002 | 0.002 | 0.041 | 0.041 |
| 4.75637127753479 | 1.001 | 0.002 | 0.002 | 0.044 | 0.044 |
| 4.75951287018838 | 1.001 | 0.002 | 0.002 | 0.047 | 0.047 |
| 4.76265446284197 | 1.001 | 0.003 | 0.003 | 0.05 | 0.05 |
| 4.765796055495559 | 1.001 | 0.003 | 0.003 | 0.053 | 0.054 |
| 4.768937648149149 | 1.001 | 0.003 | 0.003 | 0.057 | 0.057 |
| 4.772079240802738 | 1.001 | 0.004 | 0.004 | 0.06 | 0.06 |
| 4.775220833456327 | 1.002 | 0.004 | 0.004 | 0.063 | 0.063 |
| 4.778362426109917 | 1.002 | 0.004 | 0.004 | 0.066 | 0.066 |
| 4.781504018763507 | 1.002 | 0.005 | 0.005 | 0.069 | 0.069 |
| 4.784645611417097 | 1.002 | 0.005 | 0.005 | 0.072 | 0.073 |
| 4.787787204070686 | 1.002 | 0.006 | 0.006 | 0.076 | 0.076 |
| 4.790928796724275 | 1.003 | 0.006 | 0.006 | 0.079 | 0.079 |
| 4.794070389377865 | 1.003 | 0.007 | 0.007 | 0.082 | 0.082 |
| 4.797211982031455 | 1.003 | 0.007 | 0.007 | 0.085 | 0.085 |
| 4.800353574685045 | 1.003 | 0.008 | 0.008 | 0.088 | 0.089 |
| 4.803495167338634 | 1.003 | 0.008 | 0.008 | 0.091 | 0.092 |
| 4.806636759992224 | 1.004 | 0.009 | 0.009 | 0.094 | 0.095 |
| 4.809778352645814 | 1.004 | 0.009 | 0.01 | 0.098 | 0.098 |
| 4.812919945299403 | 1.004 | 0.01 | 0.01 | 0.101 | 0.102 |
| 4.816061537952993 | 1.004 | 0.011 | 0.011 | 0.104 | 0.105 |
| 4.819203130606582 | 1.005 | 0.011 | 0.012 | 0.107 | 0.108 |
| 4.822344723260172 | 1.005 | 0.012 | 0.012 | 0.11 | 0.111 |
| 4.825486315913761 | 1.005 | 0.013 | 0.013 | 0.113 | 0.115 |
| 4.828627908567351 | 1.005 | 0.014 | 0.014 | 0.117 | 0.118 |
| 4.83176950122094 | 1.006 | 0.014 | 0.014 | 0.12 | 0.121 |
| 4.83491109387453 | 1.006 | 0.015 | 0.015 | 0.123 | 0.124 |
| 4.83805268652812 | 1.006 | 0.016 | 0.016 | 0.126 | 0.128 |
| 4.841194279181709 | 1.007 | 0.017 | 0.017 | 0.129 | 0.131 |
| 4.844335871835299 | 1.007 | 0.017 | 0.018 | 0.132 | 0.134 |
| 4.847477464488889 | 1.007 | 0.018 | 0.019 | 0.136 | 0.138 |
| 4.850619057142478 | 1.008 | 0.019 | 0.019 | 0.139 | 0.141 |
| 4.853760649796068 | 1.008 | 0.02 | 0.02 | 0.142 | 0.144 |
| 4.856902242449657 | 1.009 | 0.021 | 0.021 | 0.145 | 0.148 |
| 4.860043835103247 | 1.009 | 0.022 | 0.022 | 0.148 | 0.151 |
| 4.863185427756837 | 1.009 | 0.023 | 0.023 | 0.152 | 0.154 |
| 4.866327020410426 | 1.01 | 0.024 | 0.024 | 0.155 | 0.158 |
| 4.869468613064015 | 1.01 | 0.025 | 0.025 | 0.158 | 0.161 |
| 4.872610205717605 | 1.01 | 0.026 | 0.026 | 0.161 | 0.165 |
| 4.875751798371195 | 1.011 | 0.027 | 0.027 | 0.164 | 0.168 |
| 4.878893391024784 | 1.011 | 0.028 | 0.028 | 0.168 | 0.171 |
| 4.882034983678374 | 1.012 | 0.029 | 0.03 | 0.171 | 0.175 |
| 4.885176576331964 | 1.012 | 0.03 | 0.031 | 0.174 | 0.178 |
| 4.888318168985553 | 1.013 | 0.031 | 0.032 | 0.177 | 0.182 |
| 4.891459761639143 | 1.013 | 0.032 | 0.033 | 0.18 | 0.185 |
| 4.894601354292733 | 1.014 | 0.033 | 0.034 | 0.184 | 0.189 |
| 4.897742946946322 | 1.014 | 0.034 | 0.035 | 0.187 | 0.192 |
| 4.900884539599912 | 1.015 | 0.036 | 0.037 | 0.19 | 0.196 |
| 4.904026132253501 | 1.015 | 0.037 | 0.038 | 0.193 | 0.199 |
| 4.907167724907091 | 1.016 | 0.038 | 0.039 | 0.197 | 0.203 |
| 4.91030931756068 | 1.016 | 0.039 | 0.041 | 0.2 | 0.206 |
| 4.91345091021427 | 1.017 | 0.041 | 0.042 | 0.203 | 0.21 |
| 4.91659250286786 | 1.017 | 0.042 | 0.043 | 0.206 | 0.213 |
| 4.91973409552145 | 1.018 | 0.043 | 0.045 | 0.209 | 0.217 |
| 4.922875688175039 | 1.018 | 0.044 | 0.046 | 0.213 | 0.221 |
| 4.926017280828628 | 1.019 | 0.046 | 0.048 | 0.216 | 0.224 |
| 4.929158873482218 | 1.019 | 0.047 | 0.049 | 0.219 | 0.228 |
| 4.932300466135808 | 1.02 | 0.049 | 0.05 | 0.222 | 0.231 |
| 4.935442058789397 | 1.02 | 0.05 | 0.052 | 0.226 | 0.235 |
| 4.938583651442987 | 1.021 | 0.051 | 0.054 | 0.229 | 0.239 |
| 4.941725244096576 | 1.022 | 0.053 | 0.055 | 0.232 | 0.242 |
| 4.944866836750166 | 1.022 | 0.054 | 0.057 | 0.236 | 0.246 |
| 4.948008429403755 | 1.023 | 0.056 | 0.058 | 0.239 | 0.25 |
| 4.951150022057345 | 1.023 | 0.057 | 0.06 | 0.242 | 0.254 |
| 4.954291614710935 | 1.024 | 0.059 | 0.062 | 0.245 | 0.257 |
| 4.957433207364524 | 1.025 | 0.06 | 0.063 | 0.249 | 0.261 |
| 4.960574800018114 | 1.025 | 0.062 | 0.065 | 0.252 | 0.265 |
| 4.963716392671704 | 1.026 | 0.063 | 0.067 | 0.255 | 0.269 |
| 4.966857985325293 | 1.027 | 0.065 | 0.069 | 0.258 | 0.272 |
| 4.969999577978883 | 1.027 | 0.067 | 0.07 | 0.262 | 0.276 |
| 4.973141170632472 | 1.028 | 0.068 | 0.072 | 0.265 | 0.28 |
| 4.976282763286062 | 1.029 | 0.07 | 0.074 | 0.268 | 0.284 |
| 4.979424355939651 | 1.029 | 0.072 | 0.076 | 0.272 | 0.288 |
| 4.982565948593241 | 1.03 | 0.073 | 0.078 | 0.275 | 0.292 |
| 4.985707541246831 | 1.031 | 0.075 | 0.08 | 0.278 | 0.296 |
| 4.98884913390042 | 1.032 | 0.077 | 0.082 | 0.282 | 0.3 |
| 4.99199072655401 | 1.032 | 0.079 | 0.084 | 0.285 | 0.304 |
| 4.9951323192076 | 1.033 | 0.08 | 0.086 | 0.288 | 0.308 |
| 4.99827391186119 | 1.034 | 0.082 | 0.088 | 0.292 | 0.312 |
| 5.00141550451478 | 1.035 | 0.084 | 0.09 | 0.295 | 0.316 |
| 5.004557097168369 | 1.035 | 0.086 | 0.092 | 0.298 | 0.32 |
| 5.007698689821958 | 1.036 | 0.088 | 0.094 | 0.302 | 0.324 |
| 5.010840282475548 | 1.037 | 0.09 | 0.096 | 0.305 | 0.328 |
| 5.013981875129137 | 1.038 | 0.092 | 0.099 | 0.308 | 0.332 |
| 5.017123467782727 | 1.039 | 0.093 | 0.101 | 0.312 | 0.336 |
| 5.020265060436317 | 1.039 | 0.095 | 0.103 | 0.315 | 0.34 |
| 5.023406653089906 | 1.04 | 0.097 | 0.105 | 0.318 | 0.344 |
| 5.026548245743496 | 1.041 | 0.099 | 0.108 | 0.322 | 0.349 |
| 5.029689838397085 | 1.042 | 0.101 | 0.11 | 0.325 | 0.353 |
| 5.032831431050674 | 1.043 | 0.103 | 0.113 | 0.328 | 0.357 |
| 5.035973023704264 | 1.044 | 0.106 | 0.115 | 0.332 | 0.361 |
| 5.039114616357854 | 1.045 | 0.108 | 0.117 | 0.335 | 0.366 |
| 5.042256209011444 | 1.045 | 0.11 | 0.12 | 0.339 | 0.37 |
| 5.045397801665033 | 1.046 | 0.112 | 0.122 | 0.342 | 0.374 |
| 5.048539394318622 | 1.047 | 0.114 | 0.125 | 0.345 | 0.379 |
| 5.051680986972213 | 1.048 | 0.116 | 0.128 | 0.349 | 0.383 |
| 5.054822579625802 | 1.049 | 0.118 | 0.13 | 0.352 | 0.388 |
| 5.057964172279392 | 1.05 | 0.12 | 0.133 | 0.356 | 0.392 |
| 5.061105764932981 | 1.051 | 0.123 | 0.136 | 0.359 | 0.397 |
| 5.064247357586571 | 1.052 | 0.125 | 0.138 | 0.363 | 0.401 |
| 5.067388950240161 | 1.053 | 0.127 | 0.141 | 0.366 | 0.406 |
| 5.07053054289375 | 1.054 | 0.129 | 0.144 | 0.369 | 0.41 |
| 5.07367213554734 | 1.055 | 0.132 | 0.147 | 0.373 | 0.415 |
| 5.07681372820093 | 1.056 | 0.134 | 0.149 | 0.376 | 0.419 |
| 5.079955320854519 | 1.057 | 0.136 | 0.152 | 0.38 | 0.424 |
| 5.083096913508108 | 1.058 | 0.139 | 0.155 | 0.383 | 0.429 |
| 5.086238506161698 | 1.059 | 0.141 | 0.158 | 0.387 | 0.434 |
| 5.089380098815288 | 1.06 | 0.144 | 0.161 | 0.39 | 0.438 |
| 5.092521691468877 | 1.061 | 0.146 | 0.164 | 0.394 | 0.443 |
| 5.095663284122466 | 1.062 | 0.149 | 0.167 | 0.397 | 0.448 |
| 5.098804876776057 | 1.063 | 0.151 | 0.171 | 0.401 | 0.453 |
| 5.101946469429646 | 1.064 | 0.153 | 0.174 | 0.404 | 0.458 |
| 5.105088062083236 | 1.065 | 0.156 | 0.177 | 0.408 | 0.462 |
| 5.108229654736825 | 1.066 | 0.159 | 0.18 | 0.411 | 0.467 |
| 5.111371247390415 | 1.067 | 0.161 | 0.184 | 0.415 | 0.472 |
| 5.114512840044005 | 1.068 | 0.164 | 0.187 | 0.418 | 0.477 |
| 5.117654432697594 | 1.07 | 0.166 | 0.19 | 0.422 | 0.482 |
| 5.120796025351184 | 1.071 | 0.169 | 0.194 | 0.425 | 0.488 |
| 5.123937618004773 | 1.072 | 0.172 | 0.197 | 0.429 | 0.493 |
| 5.127079210658363 | 1.073 | 0.174 | 0.201 | 0.432 | 0.498 |
| 5.130220803311953 | 1.074 | 0.177 | 0.204 | 0.436 | 0.503 |
| 5.133362395965542 | 1.075 | 0.18 | 0.208 | 0.439 | 0.508 |
| 5.136503988619131 | 1.077 | 0.182 | 0.211 | 0.443 | 0.513 |
| 5.13964558127272 | 1.078 | 0.185 | 0.215 | 0.447 | 0.519 |
| 5.142787173926311 | 1.079 | 0.188 | 0.219 | 0.45 | 0.524 |
| 5.1459287665799 | 1.08 | 0.191 | 0.222 | 0.454 | 0.529 |
| 5.14907035923349 | 1.081 | 0.193 | 0.226 | 0.457 | 0.535 |
| 5.15221195188708 | 1.083 | 0.196 | 0.23 | 0.461 | 0.54 |
| 5.15535354454067 | 1.084 | 0.199 | 0.234 | 0.465 | 0.546 |
| 5.158495137194259 | 1.085 | 0.202 | 0.238 | 0.468 | 0.551 |
| 5.161636729847848 | 1.086 | 0.205 | 0.242 | 0.472 | 0.557 |
| 5.164778322501438 | 1.088 | 0.208 | 0.246 | 0.475 | 0.563 |
| 5.167919915155028 | 1.089 | 0.211 | 0.25 | 0.479 | 0.568 |
| 5.171061507808617 | 1.09 | 0.214 | 0.254 | 0.483 | 0.574 |
| 5.174203100462206 | 1.092 | 0.217 | 0.258 | 0.486 | 0.58 |
| 5.177344693115796 | 1.093 | 0.22 | 0.262 | 0.49 | 0.585 |
| 5.180486285769386 | 1.094 | 0.223 | 0.267 | 0.494 | 0.591 |
| 5.183627878422976 | 1.096 | 0.226 | 0.271 | 0.497 | 0.597 |
| 5.186769471076565 | 1.097 | 0.229 | 0.275 | 0.501 | 0.603 |
| 5.189911063730155 | 1.098 | 0.232 | 0.28 | 0.505 | 0.609 |
| 5.193052656383744 | 1.1 | 0.235 | 0.284 | 0.508 | 0.615 |
| 5.196194249037334 | 1.101 | 0.238 | 0.289 | 0.512 | 0.621 |
| 5.199335841690924 | 1.103 | 0.241 | 0.293 | 0.516 | 0.627 |
| 5.202477434344513 | 1.104 | 0.245 | 0.298 | 0.52 | 0.633 |
| 5.205619026998103 | 1.105 | 0.248 | 0.303 | 0.523 | 0.639 |
| 5.208760619651692 | 1.107 | 0.251 | 0.308 | 0.527 | 0.646 |
| 5.211902212305282 | 1.108 | 0.254 | 0.312 | 0.531 | 0.652 |
| 5.215043804958871 | 1.11 | 0.258 | 0.317 | 0.535 | 0.658 |
| 5.218185397612461 | 1.111 | 0.261 | 0.322 | 0.538 | 0.665 |
| 5.221326990266051 | 1.113 | 0.264 | 0.327 | 0.542 | 0.671 |
| 5.22446858291964 | 1.114 | 0.268 | 0.332 | 0.546 | 0.678 |
| 5.22761017557323 | 1.116 | 0.271 | 0.337 | 0.55 | 0.684 |
| 5.23075176822682 | 1.117 | 0.274 | 0.342 | 0.554 | 0.691 |
| 5.23389336088041 | 1.119 | 0.278 | 0.348 | 0.557 | 0.698 |
| 5.237034953533999 | 1.12 | 0.281 | 0.353 | 0.561 | 0.704 |
| 5.240176546187588 | 1.122 | 0.285 | 0.358 | 0.565 | 0.711 |
| 5.243318138841178 | 1.123 | 0.288 | 0.364 | 0.569 | 0.718 |
| 5.246459731494767 | 1.125 | 0.292 | 0.369 | 0.573 | 0.725 |
| 5.249601324148357 | 1.127 | 0.295 | 0.374 | 0.577 | 0.732 |
| 5.252742916801947 | 1.128 | 0.299 | 0.38 | 0.58 | 0.739 |
| 5.255884509455536 | 1.13 | 0.302 | 0.386 | 0.584 | 0.746 |
| 5.259026102109125 | 1.131 | 0.306 | 0.391 | 0.588 | 0.753 |
| 5.262167694762715 | 1.133 | 0.309 | 0.397 | 0.592 | 0.76 |
| 5.265309287416305 | 1.135 | 0.313 | 0.403 | 0.596 | 0.767 |
| 5.268450880069895 | 1.136 | 0.317 | 0.409 | 0.6 | 0.775 |
| 5.271592472723484 | 1.138 | 0.32 | 0.415 | 0.604 | 0.782 |
| 5.274734065377074 | 1.14 | 0.324 | 0.421 | 0.608 | 0.789 |
| 5.277875658030664 | 1.142 | 0.328 | 0.427 | 0.612 | 0.797 |
| 5.281017250684253 | 1.143 | 0.331 | 0.433 | 0.616 | 0.805 |
| 5.284158843337843 | 1.145 | 0.335 | 0.439 | 0.62 | 0.812 |
| 5.287300435991432 | 1.147 | 0.339 | 0.446 | 0.624 | 0.82 |
| 5.290442028645022 | 1.148 | 0.343 | 0.452 | 0.628 | 0.828 |
| 5.293583621298612 | 1.15 | 0.347 | 0.459 | 0.632 | 0.835 |
| 5.296725213952201 | 1.152 | 0.351 | 0.465 | 0.636 | 0.843 |
| 5.299866806605791 | 1.154 | 0.354 | 0.472 | 0.64 | 0.851 |
| 5.30300839925938 | 1.156 | 0.358 | 0.479 | 0.644 | 0.859 |
| 5.30614999191297 | 1.157 | 0.362 | 0.485 | 0.648 | 0.868 |
| 5.30929158456656 | 1.159 | 0.366 | 0.492 | 0.652 | 0.876 |
| 5.312433177220149 | 1.161 | 0.37 | 0.499 | 0.656 | 0.884 |
| 5.315574769873739 | 1.163 | 0.374 | 0.506 | 0.66 | 0.892 |
| 5.318716362527328 | 1.165 | 0.378 | 0.513 | 0.664 | 0.901 |
| 5.321857955180918 | 1.167 | 0.382 | 0.52 | 0.668 | 0.909 |
| 5.324999547834508 | 1.169 | 0.386 | 0.528 | 0.672 | 0.918 |
| 5.328141140488097 | 1.171 | 0.39 | 0.535 | 0.676 | 0.926 |
| 5.331282733141686 | 1.173 | 0.395 | 0.543 | 0.68 | 0.935 |
| 5.334424325795276 | 1.174 | 0.399 | 0.55 | 0.684 | 0.944 |
| 5.337565918448866 | 1.176 | 0.403 | 0.558 | 0.688 | 0.953 |
| 5.340707511102456 | 1.178 | 0.407 | 0.565 | 0.693 | 0.962 |
| 5.343849103756045 | 1.18 | 0.411 | 0.573 | 0.697 | 0.971 |
| 5.346990696409634 | 1.182 | 0.416 | 0.581 | 0.701 | 0.98 |
| 5.350132289063224 | 1.184 | 0.42 | 0.589 | 0.705 | 0.989 |
| 5.353273881716814 | 1.186 | 0.424 | 0.597 | 0.709 | 0.998 |
| 5.356415474370403 | 1.188 | 0.428 | 0.605 | 0.714 | 1.008 |
| 5.359557067023993 | 1.191 | 0.433 | 0.613 | 0.718 | 1.017 |
| 5.362698659677583 | 1.193 | 0.437 | 0.622 | 0.722 | 1.027 |
| 5.365840252331172 | 1.195 | 0.442 | 0.63 | 0.726 | 1.037 |
| 5.368981844984762 | 1.197 | 0.446 | 0.639 | 0.731 | 1.046 |
| 5.372123437638351 | 1.199 | 0.45 | 0.647 | 0.735 | 1.056 |
| 5.375265030291941 | 1.201 | 0.455 | 0.656 | 0.739 | 1.066 |
| 5.378406622945531 | 1.203 | 0.459 | 0.665 | 0.743 | 1.076 |
| 5.38154821559912 | 1.205 | 0.464 | 0.674 | 0.748 | 1.086 |
| 5.38468980825271 | 1.208 | 0.468 | 0.683 | 0.752 | 1.097 |
| 5.387831400906299 | 1.21 | 0.473 | 0.692 | 0.756 | 1.107 |
| 5.39097299355989 | 1.212 | 0.477 | 0.701 | 0.761 | 1.117 |
| 5.394114586213479 | 1.214 | 0.482 | 0.711 | 0.765 | 1.128 |
| 5.397256178867068 | 1.216 | 0.487 | 0.72 | 0.769 | 1.138 |
| 5.400397771520657 | 1.219 | 0.491 | 0.73 | 0.774 | 1.149 |
| 5.403539364174247 | 1.221 | 0.496 | 0.739 | 0.778 | 1.16 |
| 5.406680956827837 | 1.223 | 0.501 | 0.749 | 0.783 | 1.171 |
| 5.409822549481426 | 1.225 | 0.505 | 0.759 | 0.787 | 1.182 |
| 5.412964142135016 | 1.228 | 0.51 | 0.769 | 0.791 | 1.193 |
| 5.416105734788605 | 1.23 | 0.515 | 0.779 | 0.796 | 1.204 |
| 5.419247327442195 | 1.232 | 0.52 | 0.79 | 0.8 | 1.216 |
| 5.422388920095785 | 1.235 | 0.525 | 0.8 | 0.805 | 1.227 |
| 5.425530512749375 | 1.237 | 0.53 | 0.81 | 0.809 | 1.239 |
| 5.428672105402964 | 1.24 | 0.534 | 0.821 | 0.814 | 1.251 |
| 5.431813698056554 | 1.242 | 0.539 | 0.832 | 0.818 | 1.262 |
| 5.434955290710143 | 1.244 | 0.544 | 0.843 | 0.823 | 1.274 |
| 5.438096883363733 | 1.247 | 0.549 | 0.854 | 0.827 | 1.286 |
| 5.441238476017322 | 1.249 | 0.554 | 0.865 | 0.832 | 1.299 |
| 5.444380068670912 | 1.252 | 0.559 | 0.876 | 0.837 | 1.311 |
| 5.447521661324502 | 1.254 | 0.564 | 0.888 | 0.841 | 1.323 |
| 5.450663253978091 | 1.257 | 0.569 | 0.899 | 0.846 | 1.336 |
| 5.453804846631681 | 1.259 | 0.574 | 0.911 | 0.85 | 1.349 |
| 5.456946439285271 | 1.262 | 0.579 | 0.923 | 0.855 | 1.362 |
| 5.46008803193886 | 1.264 | 0.585 | 0.935 | 0.86 | 1.374 |
| 5.46322962459245 | 1.267 | 0.59 | 0.947 | 0.864 | 1.388 |
| 5.466371217246039 | 1.27 | 0.595 | 0.959 | 0.869 | 1.401 |
| 5.46951280989963 | 1.272 | 0.6 | 0.971 | 0.874 | 1.414 |
| 5.472654402553218 | 1.275 | 0.605 | 0.984 | 0.878 | 1.428 |
| 5.475795995206808 | 1.277 | 0.611 | 0.996 | 0.883 | 1.441 |
| 5.478937587860398 | 1.28 | 0.616 | 1.009 | 0.888 | 1.455 |
| 5.482079180513987 | 1.283 | 0.621 | 1.022 | 0.893 | 1.469 |
| 5.485220773167577 | 1.285 | 0.627 | 1.035 | 0.897 | 1.483 |
| 5.488362365821166 | 1.288 | 0.632 | 1.049 | 0.902 | 1.497 |
| 5.491503958474756 | 1.291 | 0.637 | 1.062 | 0.907 | 1.512 |
| 5.494645551128346 | 1.294 | 0.643 | 1.076 | 0.912 | 1.526 |
| 5.497787143781935 | 1.296 | 0.648 | 1.089 | 0.917 | 1.541 |
| 5.500928736435525 | 1.299 | 0.654 | 1.103 | 0.922 | 1.555 |
| 5.504070329089115 | 1.302 | 0.659 | 1.117 | 0.926 | 1.57 |
| 5.507211921742704 | 1.305 | 0.665 | 1.132 | 0.931 | 1.586 |
| 5.510353514396294 | 1.308 | 0.67 | 1.146 | 0.936 | 1.601 |
| 5.513495107049883 | 1.31 | 0.676 | 1.161 | 0.941 | 1.616 |
| 5.516636699703473 | 1.313 | 0.681 | 1.175 | 0.946 | 1.632 |
| 5.519778292357062 | 1.316 | 0.687 | 1.19 | 0.951 | 1.648 |
| 5.522919885010652 | 1.319 | 0.693 | 1.205 | 0.956 | 1.664 |
| 5.526061477664242 | 1.322 | 0.698 | 1.221 | 0.961 | 1.68 |
| 5.529203070317831 | 1.325 | 0.704 | 1.236 | 0.966 | 1.696 |
| 5.532344662971421 | 1.328 | 0.71 | 1.252 | 0.971 | 1.712 |
| 5.535486255625011 | 1.331 | 0.716 | 1.268 | 0.976 | 1.729 |
| 5.5386278482786 | 1.334 | 0.721 | 1.284 | 0.981 | 1.746 |
| 5.54176944093219 | 1.337 | 0.727 | 1.3 | 0.986 | 1.763 |
| 5.544911033585779 | 1.34 | 0.733 | 1.316 | 0.991 | 1.78 |
| 5.54805262623937 | 1.343 | 0.739 | 1.333 | 0.996 | 1.797 |
| 5.551194218892959 | 1.346 | 0.745 | 1.35 | 1.001 | 1.815 |
| 5.554335811546548 | 1.349 | 0.751 | 1.367 | 1.006 | 1.832 |
| 5.557477404200137 | 1.352 | 0.757 | 1.384 | 1.012 | 1.85 |
| 5.560618996853727 | 1.356 | 0.763 | 1.401 | 1.017 | 1.868 |
| 5.563760589507317 | 1.359 | 0.769 | 1.419 | 1.022 | 1.887 |
| 5.566902182160906 | 1.362 | 0.775 | 1.437 | 1.027 | 1.905 |
| 5.570043774814496 | 1.365 | 0.781 | 1.455 | 1.032 | 1.924 |
| 5.573185367468086 | 1.368 | 0.787 | 1.473 | 1.038 | 1.943 |
| 5.576326960121675 | 1.371 | 0.793 | 1.492 | 1.043 | 1.962 |
| 5.579468552775264 | 1.375 | 0.799 | 1.51 | 1.048 | 1.981 |
| 5.582610145428854 | 1.378 | 0.805 | 1.529 | 1.053 | 2 |
| 5.585751738082444 | 1.381 | 0.812 | 1.548 | 1.059 | 2.02 |
| 5.588893330736034 | 1.385 | 0.818 | 1.568 | 1.064 | 2.04 |
| 5.592034923389623 | 1.388 | 0.824 | 1.587 | 1.069 | 2.06 |
| 5.595176516043213 | 1.391 | 0.83 | 1.607 | 1.075 | 2.08 |
| 5.598318108696803 | 1.395 | 0.837 | 1.627 | 1.08 | 2.101 |
| 5.601459701350392 | 1.398 | 0.843 | 1.648 | 1.086 | 2.122 |
| 5.604601294003982 | 1.401 | 0.849 | 1.668 | 1.091 | 2.143 |
| 5.607742886657571 | 1.405 | 0.856 | 1.689 | 1.096 | 2.164 |
| 5.610884479311161 | 1.408 | 0.862 | 1.71 | 1.102 | 2.186 |
| 5.61402607196475 | 1.412 | 0.869 | 1.731 | 1.107 | 2.207 |
| 5.61716766461834 | 1.415 | 0.875 | 1.753 | 1.113 | 2.229 |
| 5.62030925727193 | 1.419 | 0.882 | 1.775 | 1.118 | 2.251 |
| 5.623450849925519 | 1.422 | 0.888 | 1.797 | 1.124 | 2.274 |
| 5.626592442579109 | 1.426 | 0.895 | 1.819 | 1.129 | 2.296 |
| 5.629734035232698 | 1.43 | 0.901 | 1.842 | 1.135 | 2.319 |
| 5.632875627886288 | 1.433 | 0.908 | 1.864 | 1.141 | 2.343 |
| 5.636017220539878 | 1.437 | 0.914 | 1.888 | 1.146 | 2.366 |
| 5.639158813193467 | 1.44 | 0.921 | 1.911 | 1.152 | 2.39 |
| 5.642300405847057 | 1.444 | 0.928 | 1.935 | 1.157 | 2.414 |
| 5.645441998500646 | 1.448 | 0.935 | 1.959 | 1.163 | 2.438 |
| 5.648583591154236 | 1.451 | 0.941 | 1.983 | 1.169 | 2.462 |
| 5.651725183807825 | 1.455 | 0.948 | 2.007 | 1.175 | 2.487 |
| 5.654866776461415 | 1.459 | 0.955 | 2.032 | 1.18 | 2.512 |
| 5.658008369115005 | 1.463 | 0.962 | 2.057 | 1.186 | 2.537 |
| 5.661149961768594 | 1.466 | 0.969 | 2.083 | 1.192 | 2.563 |
| 5.664291554422184 | 1.47 | 0.975 | 2.109 | 1.198 | 2.589 |
| 5.667433147075774 | 1.474 | 0.982 | 2.135 | 1.203 | 2.615 |
| 5.670574739729363 | 1.478 | 0.989 | 2.161 | 1.209 | 2.641 |
| 5.673716332382953 | 1.482 | 0.996 | 2.188 | 1.215 | 2.668 |
| 5.676857925036542 | 1.486 | 1.003 | 2.215 | 1.221 | 2.695 |
| 5.679999517690132 | 1.49 | 1.01 | 2.242 | 1.227 | 2.722 |
| 5.683141110343721 | 1.494 | 1.017 | 2.269 | 1.233 | 2.75 |
| 5.686282702997311 | 1.498 | 1.024 | 2.297 | 1.239 | 2.778 |
| 5.689424295650901 | 1.502 | 1.032 | 2.326 | 1.245 | 2.806 |
| 5.69256588830449 | 1.506 | 1.039 | 2.354 | 1.25 | 2.834 |
| 5.69570748095808 | 1.51 | 1.046 | 2.383 | 1.256 | 2.863 |
| 5.69884907361167 | 1.514 | 1.053 | 2.412 | 1.262 | 2.892 |
| 5.701990666265259 | 1.518 | 1.06 | 2.442 | 1.268 | 2.922 |
| 5.705132258918849 | 1.522 | 1.067 | 2.472 | 1.275 | 2.951 |
| 5.708273851572438 | 1.526 | 1.075 | 2.502 | 1.281 | 2.982 |
| 5.711415444226028 | 1.53 | 1.082 | 2.533 | 1.287 | 3.012 |
| 5.714557036879618 | 1.534 | 1.089 | 2.564 | 1.293 | 3.043 |
| 5.717698629533207 | 1.538 | 1.097 | 2.595 | 1.299 | 3.074 |
| 5.720840222186797 | 1.543 | 1.104 | 2.627 | 1.305 | 3.105 |
| 5.723981814840386 | 1.547 | 1.111 | 2.659 | 1.311 | 3.137 |
| 5.727123407493976 | 1.551 | 1.119 | 2.692 | 1.317 | 3.169 |
| 5.730265000147565 | 1.555 | 1.126 | 2.725 | 1.324 | 3.202 |
| 5.733406592801155 | 1.56 | 1.134 | 2.758 | 1.33 | 3.234 |
| 5.736548185454744 | 1.564 | 1.141 | 2.791 | 1.336 | 3.268 |
| 5.739689778108334 | 1.568 | 1.149 | 2.825 | 1.342 | 3.301 |
| 5.742831370761924 | 1.573 | 1.156 | 2.86 | 1.349 | 3.335 |
| 5.745972963415514 | 1.577 | 1.164 | 2.895 | 1.355 | 3.369 |
| 5.749114556069103 | 1.581 | 1.172 | 2.93 | 1.361 | 3.404 |
| 5.752256148722693 | 1.586 | 1.179 | 2.965 | 1.367 | 3.439 |
| 5.755397741376282 | 1.59 | 1.187 | 3.001 | 1.374 | 3.474 |
| 5.758539334029872 | 1.595 | 1.195 | 3.038 | 1.38 | 3.51 |
| 5.761680926683462 | 1.599 | 1.202 | 3.075 | 1.387 | 3.546 |
| 5.764822519337051 | 1.604 | 1.21 | 3.112 | 1.393 | 3.582 |
| 5.767964111990641 | 1.608 | 1.218 | 3.149 | 1.399 | 3.619 |
| 5.77110570464423 | 1.613 | 1.226 | 3.188 | 1.406 | 3.657 |
| 5.77424729729782 | 1.617 | 1.233 | 3.226 | 1.412 | 3.694 |
| 5.77738888995141 | 1.622 | 1.241 | 3.265 | 1.419 | 3.732 |
| 5.780530482605 | 1.627 | 1.249 | 3.304 | 1.425 | 3.771 |
| 5.783672075258588 | 1.631 | 1.257 | 3.344 | 1.432 | 3.81 |
| 5.786813667912178 | 1.636 | 1.265 | 3.384 | 1.438 | 3.849 |
| 5.789955260565768 | 1.64 | 1.273 | 3.425 | 1.445 | 3.889 |
| 5.793096853219358 | 1.645 | 1.281 | 3.466 | 1.452 | 3.929 |
| 5.796238445872947 | 1.65 | 1.289 | 3.508 | 1.458 | 3.969 |
| 5.799380038526537 | 1.655 | 1.297 | 3.55 | 1.465 | 4.01 |
| 5.802521631180126 | 1.659 | 1.305 | 3.592 | 1.471 | 4.051 |
| 5.805663223833715 | 1.664 | 1.313 | 3.635 | 1.478 | 4.093 |
| 5.808804816487306 | 1.669 | 1.321 | 3.679 | 1.485 | 4.135 |
| 5.811946409140895 | 1.674 | 1.329 | 3.723 | 1.491 | 4.178 |
| 5.815088001794485 | 1.679 | 1.337 | 3.767 | 1.498 | 4.221 |
| 5.818229594448074 | 1.683 | 1.345 | 3.812 | 1.505 | 4.265 |
| 5.821371187101663 | 1.688 | 1.353 | 3.857 | 1.511 | 4.309 |
| 5.824512779755254 | 1.693 | 1.361 | 3.903 | 1.518 | 4.353 |
| 5.827654372408843 | 1.698 | 1.369 | 3.949 | 1.525 | 4.398 |
| 5.830795965062433 | 1.703 | 1.378 | 3.996 | 1.532 | 4.443 |
| 5.833937557716022 | 1.708 | 1.386 | 4.043 | 1.539 | 4.489 |
| 5.837079150369612 | 1.713 | 1.394 | 4.091 | 1.545 | 4.535 |
| 5.840220743023201 | 1.718 | 1.402 | 4.139 | 1.552 | 4.581 |
| 5.843362335676791 | 1.723 | 1.411 | 4.188 | 1.559 | 4.628 |
| 5.846503928330381 | 1.728 | 1.419 | 4.237 | 1.566 | 4.676 |
| 5.84964552098397 | 1.733 | 1.427 | 4.287 | 1.573 | 4.724 |
| 5.85278711363756 | 1.738 | 1.436 | 4.337 | 1.58 | 4.772 |
| 5.85592870629115 | 1.743 | 1.444 | 4.388 | 1.586 | 4.821 |
| 5.85907029894474 | 1.748 | 1.452 | 4.439 | 1.593 | 4.87 |
| 5.862211891598329 | 1.753 | 1.461 | 4.49 | 1.6 | 4.92 |
| 5.865353484251918 | 1.759 | 1.469 | 4.543 | 1.607 | 4.97 |
| 5.868495076905508 | 1.764 | 1.477 | 4.595 | 1.614 | 5.021 |
| 5.871636669559098 | 1.769 | 1.486 | 4.649 | 1.621 | 5.072 |
| 5.874778262212687 | 1.774 | 1.494 | 4.702 | 1.628 | 5.124 |
| 5.877919854866277 | 1.779 | 1.503 | 4.756 | 1.635 | 5.176 |
| 5.881061447519866 | 1.784 | 1.511 | 4.811 | 1.642 | 5.228 |
| 5.884203040173456 | 1.79 | 1.52 | 4.866 | 1.649 | 5.281 |
| 5.887344632827046 | 1.795 | 1.528 | 4.922 | 1.656 | 5.335 |
| 5.890486225480635 | 1.8 | 1.536 | 4.978 | 1.663 | 5.389 |
| 5.893627818134224 | 1.805 | 1.545 | 5.035 | 1.67 | 5.443 |
| 5.896769410787814 | 1.811 | 1.553 | 5.092 | 1.677 | 5.498 |
| 5.899911003441404 | 1.816 | 1.562 | 5.15 | 1.684 | 5.553 |
| 5.903052596094994 | 1.821 | 1.57 | 5.208 | 1.691 | 5.609 |
| 5.906194188748583 | 1.826 | 1.579 | 5.267 | 1.698 | 5.665 |
| 5.909335781402172 | 1.832 | 1.587 | 5.326 | 1.705 | 5.722 |
| 5.912477374055762 | 1.837 | 1.596 | 5.386 | 1.712 | 5.779 |
| 5.915618966709352 | 1.842 | 1.605 | 5.446 | 1.719 | 5.836 |
| 5.918760559362942 | 1.848 | 1.613 | 5.507 | 1.726 | 5.894 |
| 5.921902152016531 | 1.853 | 1.622 | 5.568 | 1.733 | 5.953 |
| 5.92504374467012 | 1.858 | 1.63 | 5.63 | 1.741 | 6.012 |
| 5.92818533732371 | 1.864 | 1.639 | 5.692 | 1.748 | 6.071 |
| 5.9313269299773 | 1.869 | 1.647 | 5.755 | 1.755 | 6.131 |
| 5.93446852263089 | 1.875 | 1.656 | 5.818 | 1.762 | 6.191 |
| 5.93761011528448 | 1.88 | 1.664 | 5.882 | 1.769 | 6.252 |
| 5.940751707938068 | 1.885 | 1.673 | 5.946 | 1.776 | 6.313 |
| 5.943893300591658 | 1.891 | 1.681 | 6.011 | 1.783 | 6.374 |
| 5.947034893245248 | 1.896 | 1.69 | 6.076 | 1.79 | 6.436 |
| 5.950176485898837 | 1.902 | 1.698 | 6.141 | 1.797 | 6.498 |
| 5.953318078552427 | 1.907 | 1.707 | 6.207 | 1.804 | 6.561 |
| 5.956459671206017 | 1.912 | 1.715 | 6.274 | 1.811 | 6.624 |
| 5.959601263859606 | 1.918 | 1.724 | 6.34 | 1.818 | 6.687 |
| 5.962742856513196 | 1.923 | 1.732 | 6.408 | 1.825 | 6.751 |
| 5.965884449166785 | 1.929 | 1.741 | 6.475 | 1.832 | 6.815 |
| 5.969026041820375 | 1.934 | 1.749 | 6.543 | 1.839 | 6.88 |
| 5.972167634473964 | 1.939 | 1.758 | 6.612 | 1.846 | 6.945 |
| 5.975309227127554 | 1.945 | 1.766 | 6.681 | 1.853 | 7.01 |
| 5.978450819781144 | 1.95 | 1.775 | 6.75 | 1.86 | 7.076 |
| 5.981592412434733 | 1.956 | 1.783 | 6.819 | 1.867 | 7.142 |
| 5.984734005088323 | 1.961 | 1.791 | 6.889 | 1.874 | 7.208 |
| 5.987875597741913 | 1.966 | 1.8 | 6.96 | 1.881 | 7.275 |
| 5.991017190395502 | 1.972 | 1.808 | 7.03 | 1.888 | 7.342 |
| 5.994158783049092 | 1.977 | 1.817 | 7.102 | 1.895 | 7.409 |
| 5.997300375702681 | 1.983 | 1.825 | 7.173 | 1.902 | 7.476 |
| 6.000441968356271 | 1.988 | 1.833 | 7.244 | 1.909 | 7.544 |
| 6.003583561009861 | 1.993 | 1.841 | 7.316 | 1.916 | 7.612 |
| 6.00672515366345 | 1.999 | 1.85 | 7.389 | 1.923 | 7.68 |
| 6.00986674631704 | 2.004 | 1.858 | 7.461 | 1.93 | 7.749 |
| 6.01300833897063 | 2.009 | 1.866 | 7.534 | 1.936 | 7.817 |
| 6.01614993162422 | 2.015 | 1.874 | 7.607 | 1.943 | 7.886 |
| 6.019291524277808 | 2.02 | 1.882 | 7.68 | 1.95 | 7.955 |
| 6.022433116931398 | 2.025 | 1.891 | 7.753 | 1.957 | 8.024 |
| 6.025574709584988 | 2.03 | 1.899 | 7.827 | 1.963 | 8.094 |
| 6.028716302238577 | 2.036 | 1.907 | 7.901 | 1.97 | 8.163 |
| 6.031857894892167 | 2.041 | 1.915 | 7.974 | 1.977 | 8.233 |
| 6.034999487545757 | 2.046 | 1.923 | 8.048 | 1.983 | 8.303 |
| 6.038141080199346 | 2.051 | 1.93 | 8.122 | 1.99 | 8.373 |
| 6.041282672852935 | 2.056 | 1.938 | 8.197 | 1.996 | 8.443 |
| 6.044424265506525 | 2.062 | 1.946 | 8.271 | 2.003 | 8.512 |
| 6.047565858160115 | 2.067 | 1.954 | 8.345 | 2.01 | 8.582 |
| 6.050707450813704 | 2.072 | 1.962 | 8.42 | 2.016 | 8.652 |
| 6.053849043467294 | 2.077 | 1.969 | 8.494 | 2.022 | 8.722 |
| 6.056990636120884 | 2.082 | 1.977 | 8.568 | 2.029 | 8.792 |
| 6.060132228774473 | 2.087 | 1.985 | 8.643 | 2.035 | 8.862 |
| 6.063273821428063 | 2.092 | 1.992 | 8.717 | 2.041 | 8.932 |
| 6.066415414081653 | 2.097 | 2 | 8.791 | 2.048 | 9.002 |
| 6.069557006735242 | 2.102 | 2.007 | 8.865 | 2.054 | 9.071 |
| 6.072698599388831 | 2.107 | 2.015 | 8.939 | 2.06 | 9.141 |
| 6.07584019204242 | 2.111 | 2.022 | 9.013 | 2.066 | 9.21 |
| 6.078981784696011 | 2.116 | 2.029 | 9.087 | 2.072 | 9.279 |
| 6.082123377349601 | 2.121 | 2.036 | 9.16 | 2.078 | 9.348 |
| 6.08526497000319 | 2.126 | 2.043 | 9.233 | 2.084 | 9.417 |
| 6.08840656265678 | 2.13 | 2.051 | 9.306 | 2.09 | 9.485 |
| 6.09154815531037 | 2.135 | 2.058 | 9.379 | 2.096 | 9.554 |
| 6.094689747963959 | 2.14 | 2.064 | 9.451 | 2.102 | 9.621 |
| 6.097831340617549 | 2.144 | 2.071 | 9.523 | 2.107 | 9.689 |
| 6.100972933271138 | 2.149 | 2.078 | 9.594 | 2.113 | 9.756 |
| 6.104114525924728 | 2.153 | 2.085 | 9.666 | 2.119 | 9.823 |
| 6.107256118578317 | 2.158 | 2.092 | 9.736 | 2.124 | 9.889 |
| 6.110397711231907 | 2.162 | 2.098 | 9.807 | 2.13 | 9.955 |
| 6.113539303885497 | 2.166 | 2.105 | 9.876 | 2.135 | 10.02 |
| 6.116680896539086 | 2.171 | 2.111 | 9.946 | 2.141 | 10.085 |
| 6.119822489192675 | 2.175 | 2.117 | 10.014 | 2.146 | 10.149 |
| 6.122964081846265 | 2.179 | 2.124 | 10.082 | 2.151 | 10.213 |
| 6.126105674499855 | 2.183 | 2.13 | 10.15 | 2.156 | 10.276 |
| 6.129247267153445 | 2.187 | 2.136 | 10.217 | 2.161 | 10.339 |
| 6.132388859807034 | 2.191 | 2.142 | 10.283 | 2.166 | 10.401 |
| 6.135530452460624 | 2.195 | 2.148 | 10.348 | 2.171 | 10.462 |
| 6.138672045114213 | 2.199 | 2.153 | 10.413 | 2.176 | 10.523 |
| 6.141813637767803 | 2.203 | 2.159 | 10.477 | 2.181 | 10.583 |
| 6.144955230421393 | 2.207 | 2.165 | 10.54 | 2.186 | 10.642 |
| 6.148096823074982 | 2.21 | 2.17 | 10.602 | 2.19 | 10.7 |
| 6.151238415728571 | 2.214 | 2.176 | 10.664 | 2.195 | 10.757 |
| 6.154380008382161 | 2.217 | 2.181 | 10.724 | 2.199 | 10.814 |
| 6.157521601035751 | 2.221 | 2.186 | 10.784 | 2.203 | 10.869 |
| 6.16066319368934 | 2.224 | 2.191 | 10.842 | 2.208 | 10.924 |
| 6.16380478634293 | 2.228 | 2.196 | 10.9 | 2.212 | 10.978 |
| 6.16694637899652 | 2.231 | 2.201 | 10.956 | 2.216 | 11.031 |
| 6.170087971650109 | 2.234 | 2.206 | 11.012 | 2.22 | 11.083 |
| 6.173229564303698 | 2.237 | 2.211 | 11.066 | 2.224 | 11.133 |
| 6.176371156957289 | 2.241 | 2.215 | 11.119 | 2.228 | 11.183 |
| 6.179512749610878 | 2.244 | 2.219 | 11.171 | 2.231 | 11.232 |
| 6.182654342264468 | 2.246 | 2.224 | 11.222 | 2.235 | 11.279 |
| 6.185795934918057 | 2.249 | 2.228 | 11.272 | 2.239 | 11.326 |
| 6.188937527571647 | 2.252 | 2.232 | 11.32 | 2.242 | 11.371 |
| 6.192079120225237 | 2.255 | 2.236 | 11.368 | 2.245 | 11.415 |
| 6.195220712878826 | 2.257 | 2.24 | 11.413 | 2.249 | 11.458 |
| 6.198362305532415 | 2.26 | 2.244 | 11.458 | 2.252 | 11.499 |
| 6.201503898186005 | 2.262 | 2.247 | 11.501 | 2.255 | 11.54 |
| 6.204645490839594 | 2.265 | 2.251 | 11.543 | 2.258 | 11.579 |
| 6.207787083493184 | 2.267 | 2.254 | 11.583 | 2.26 | 11.616 |
| 6.210928676146774 | 2.269 | 2.257 | 11.622 | 2.263 | 11.652 |
| 6.214070268800364 | 2.271 | 2.26 | 11.66 | 2.266 | 11.687 |
| 6.217211861453953 | 2.273 | 2.263 | 11.695 | 2.268 | 11.721 |
| 6.220353454107543 | 2.275 | 2.266 | 11.73 | 2.271 | 11.753 |
| 6.223495046761133 | 2.277 | 2.269 | 11.763 | 2.273 | 11.784 |
| 6.226636639414722 | 2.279 | 2.271 | 11.794 | 2.275 | 11.813 |
| 6.229778232068312 | 2.28 | 2.274 | 11.824 | 2.277 | 11.841 |
| 6.232919824721901 | 2.282 | 2.276 | 11.852 | 2.279 | 11.867 |
| 6.236061417375491 | 2.283 | 2.278 | 11.879 | 2.281 | 11.892 |
| 6.23920301002908 | 2.285 | 2.28 | 11.904 | 2.283 | 11.915 |
| 6.24234460268267 | 2.286 | 2.282 | 11.927 | 2.284 | 11.937 |
| 6.24548619533626 | 2.287 | 2.284 | 11.949 | 2.286 | 11.957 |
| 6.24862778798985 | 2.288 | 2.286 | 11.969 | 2.287 | 11.976 |
| 6.251769380643438 | 2.289 | 2.287 | 11.987 | 2.288 | 11.993 |
| 6.254910973297028 | 2.29 | 2.288 | 12.003 | 2.289 | 12.008 |
| 6.258052565950618 | 2.291 | 2.29 | 12.018 | 2.29 | 12.022 |
| 6.261194158604208 | 2.292 | 2.291 | 12.031 | 2.291 | 12.034 |
| 6.264335751257797 | 2.292 | 2.292 | 12.043 | 2.292 | 12.045 |
| 6.267477343911387 | 2.293 | 2.292 | 12.053 | 2.293 | 12.054 |
| 6.270618936564976 | 2.293 | 2.293 | 12.06 | 2.293 | 12.061 |
| 6.273760529218566 | 2.294 | 2.294 | 12.067 | 2.294 | 12.067 |
| 6.276902121872155 | 2.294 | 2.294 | 12.071 | 2.294 | 12.071 |
| 6.280043714525745 | 2.294 | 2.294 | 12.074 | 2.294 | 12.074 |
| 6.283185307179335 | 2.294 | 2.294 | 12.075 | 2.294 | 12.075 |